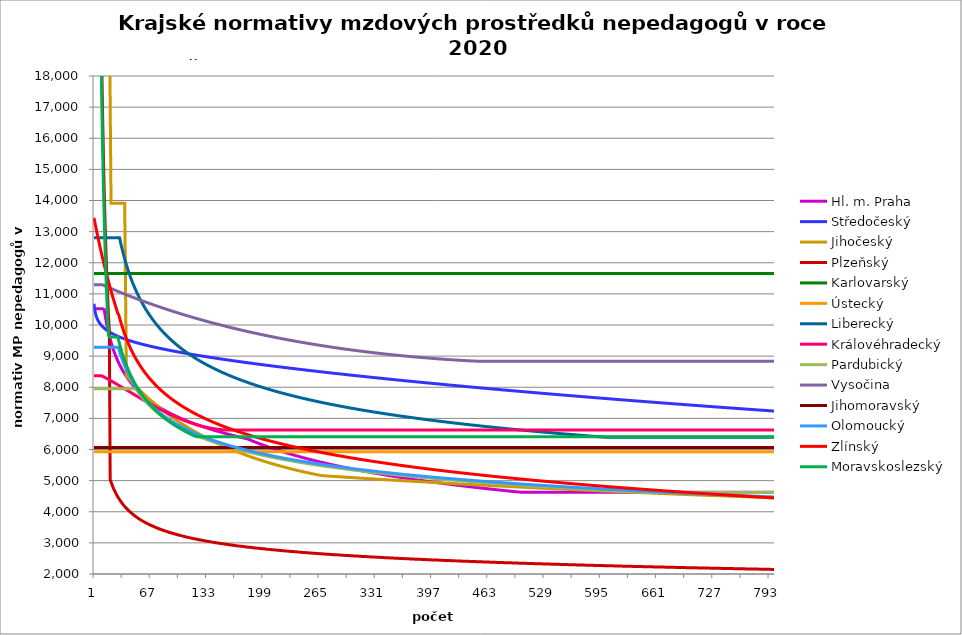
| Category | Hl. m. Praha | Středočeský | Jihočeský | Plzeňský | Karlovarský  | Ústecký   | Liberecký | Královéhradecký | Pardubický | Vysočina | Jihomoravský | Olomoucký | Zlínský | Moravskoslezský |
|---|---|---|---|---|---|---|---|---|---|---|---|---|---|---|
| 0 | 10522.629 | 10682.171 | 47853.511 | 185797.297 | 11657.998 | 5928.91 | 12801.653 | 8369.806 | 7955.115 | 11290.607 | 6064.946 | 9286.859 | 13441.965 | 174150 |
| 1 | 10522.629 | 10466.165 | 47853.511 | 92898.649 | 11657.998 | 5928.91 | 12801.653 | 8369.806 | 7955.115 | 11290.607 | 6064.946 | 9286.859 | 13301.283 | 87075 |
| 2 | 10522.629 | 10342.35 | 47853.511 | 61932.432 | 11657.998 | 5928.91 | 12801.653 | 8369.806 | 7955.115 | 11290.607 | 6064.946 | 9286.859 | 13163.515 | 58050 |
| 3 | 10522.629 | 10255.256 | 47853.511 | 46449.324 | 11657.998 | 5928.91 | 12801.653 | 8369.806 | 7955.115 | 11290.607 | 6064.946 | 9286.859 | 13028.571 | 43537.5 |
| 4 | 10522.629 | 10187.938 | 47853.511 | 37159.459 | 11657.998 | 5928.91 | 12801.653 | 8369.806 | 7955.115 | 11290.607 | 6064.946 | 9286.859 | 12896.367 | 34830 |
| 5 | 10522.629 | 10132.968 | 47853.511 | 30966.216 | 11657.998 | 5928.91 | 12801.653 | 8369.806 | 7955.115 | 11290.607 | 6064.946 | 9286.859 | 12766.818 | 29025 |
| 6 | 10522.629 | 10086.435 | 47853.511 | 26542.471 | 11657.998 | 5928.91 | 12801.653 | 8369.806 | 7955.115 | 11290.607 | 6064.946 | 9286.859 | 12639.846 | 24878.571 |
| 7 | 10522.629 | 10046.025 | 47853.511 | 23224.662 | 11657.998 | 5928.91 | 12801.653 | 8369.806 | 7955.115 | 11290.607 | 6064.946 | 9286.859 | 12515.375 | 21768.75 |
| 8 | 10522.629 | 10010.259 | 47853.511 | 20644.144 | 11657.998 | 5928.91 | 12801.653 | 8369.806 | 7955.115 | 11290.607 | 6064.946 | 9286.859 | 12393.331 | 19350 |
| 9 | 10522.629 | 9978.135 | 47853.511 | 18579.73 | 11657.998 | 5928.91 | 12801.653 | 8369.806 | 7955.115 | 11290.607 | 6064.946 | 9286.859 | 12273.645 | 17415 |
| 10 | 10522.629 | 9948.942 | 20305.409 | 16890.663 | 11657.998 | 5928.91 | 12801.653 | 8356.329 | 7955.115 | 11290.607 | 6064.946 | 9286.859 | 12156.248 | 15831.818 |
| 11 | 10522.629 | 9922.156 | 20305.409 | 15483.108 | 11657.998 | 5928.91 | 12801.653 | 8342.894 | 7955.115 | 11278.536 | 6064.946 | 9286.859 | 12041.076 | 14512.5 |
| 12 | 10494.666 | 9897.384 | 20305.409 | 14292.1 | 11657.998 | 5928.91 | 12801.653 | 8326.829 | 7955.115 | 11266.836 | 6064.946 | 9286.859 | 11928.065 | 13396.154 |
| 13 | 10318.389 | 9874.321 | 20305.409 | 13271.236 | 11657.998 | 5928.91 | 12801.653 | 8313.489 | 7955.115 | 11254.816 | 6064.946 | 9286.859 | 11817.157 | 12439.286 |
| 14 | 10159.276 | 9852.725 | 20305.409 | 12386.486 | 11657.998 | 5928.91 | 12801.653 | 8297.538 | 7955.115 | 11242.822 | 6064.946 | 9286.859 | 11708.291 | 11610 |
| 15 | 10014.594 | 9832.404 | 20305.409 | 11612.331 | 11657.998 | 5928.91 | 12801.653 | 8281.647 | 7955.115 | 11230.853 | 6064.946 | 9286.859 | 11601.413 | 10884.375 |
| 16 | 9882.188 | 9813.198 | 20305.409 | 10929.253 | 11657.998 | 5928.91 | 12801.653 | 8268.451 | 7955.115 | 11219.251 | 6064.946 | 9286.859 | 11496.469 | 10244.118 |
| 17 | 9760.334 | 9794.978 | 20305.409 | 10322.072 | 11657.998 | 5928.91 | 12801.653 | 8252.672 | 7955.115 | 11207.333 | 6064.946 | 9286.859 | 11393.407 | 9675 |
| 18 | 9647.632 | 9777.636 | 20305.409 | 9778.805 | 11657.998 | 5928.91 | 12801.653 | 8236.952 | 7955.115 | 11195.779 | 6064.946 | 9286.859 | 11292.175 | 9612.519 |
| 19 | 9542.932 | 9761.079 | 20305.409 | 5036.264 | 11657.998 | 5928.91 | 12801.653 | 8221.293 | 7955.115 | 11183.911 | 6064.946 | 9286.859 | 11192.727 | 9612.519 |
| 20 | 9445.28 | 9745.229 | 13912.965 | 4955.487 | 11657.998 | 5928.91 | 12801.653 | 8205.693 | 7955.115 | 11172.405 | 6064.946 | 9286.859 | 11095.015 | 9612.519 |
| 21 | 9353.876 | 9730.02 | 13912.965 | 4880.724 | 11657.998 | 5928.91 | 12801.653 | 8190.152 | 7955.115 | 11160.586 | 6064.946 | 9286.859 | 10998.995 | 9612.519 |
| 22 | 9268.043 | 9715.392 | 13912.965 | 4810.707 | 11657.998 | 5928.91 | 12801.653 | 8174.669 | 7955.115 | 11149.129 | 6064.946 | 9286.859 | 10904.622 | 9612.519 |
| 23 | 9187.205 | 9701.297 | 13912.965 | 4745.944 | 11657.998 | 5928.91 | 12801.653 | 8159.245 | 7955.115 | 11137.695 | 6064.946 | 9286.859 | 10811.855 | 9612.519 |
| 24 | 9110.865 | 9687.689 | 13912.965 | 4685.296 | 11657.998 | 5928.91 | 12801.653 | 8143.879 | 7955.115 | 11126.284 | 6064.946 | 9286.859 | 10720.653 | 9612.519 |
| 25 | 9038.596 | 9674.529 | 13912.965 | 4628.514 | 11657.998 | 5928.91 | 12801.653 | 8128.571 | 7955.115 | 11114.897 | 6064.946 | 9286.859 | 10630.977 | 9612.519 |
| 26 | 8970.025 | 9661.784 | 13912.965 | 4574.613 | 11657.998 | 5928.91 | 12801.653 | 8110.785 | 7955.115 | 11103.533 | 6064.946 | 9286.859 | 10542.788 | 9612.519 |
| 27 | 8904.827 | 9649.423 | 13912.965 | 4524.93 | 11657.998 | 5928.91 | 12801.653 | 8095.601 | 7955.115 | 11092.193 | 6064.946 | 9286.859 | 10456.051 | 9612.519 |
| 28 | 8842.715 | 9637.418 | 13912.965 | 4477.043 | 11657.998 | 5928.91 | 12801.653 | 8077.958 | 7955.115 | 11080.875 | 6064.946 | 9286.859 | 10370.729 | 9612.519 |
| 29 | 8783.438 | 9625.745 | 13912.965 | 4431.587 | 11657.998 | 5928.91 | 12801.653 | 8062.896 | 7955.115 | 11069.912 | 6064.946 | 9238.436 | 10330.271 | 9500.918 |
| 30 | 8726.77 | 9614.382 | 13912.965 | 4389.146 | 11657.998 | 5928.91 | 12801.729 | 8047.891 | 7955.115 | 11058.64 | 6064.946 | 9149.834 | 10228.135 | 9394.342 |
| 31 | 8672.513 | 9603.309 | 13912.965 | 4348.885 | 11657.998 | 5928.91 | 12674.904 | 8030.455 | 7955.115 | 11047.391 | 6064.946 | 9062.916 | 10130.995 | 9293.403 |
| 32 | 8620.487 | 9592.507 | 13912.965 | 4310.031 | 11657.998 | 5928.91 | 12554.304 | 8013.095 | 7955.115 | 11036.165 | 6064.946 | 8984.136 | 10038.443 | 9197.619 |
| 33 | 8570.533 | 9581.961 | 13912.965 | 4273.193 | 11657.998 | 5928.91 | 12439.426 | 7998.274 | 7955.115 | 11025.29 | 6064.946 | 8906.715 | 9950.118 | 9106.563 |
| 34 | 8522.506 | 9571.655 | 13912.965 | 4237.633 | 11657.998 | 5928.91 | 12329.823 | 7981.052 | 7955.115 | 11014.109 | 6064.946 | 8833.761 | 9865.695 | 9019.856 |
| 35 | 8476.276 | 9561.576 | 13912.965 | 4203.944 | 11657.998 | 5928.91 | 12225.096 | 7963.904 | 7955.115 | 11003.278 | 6064.946 | 8761.992 | 9784.885 | 8937.159 |
| 36 | 8431.724 | 9551.711 | 13912.965 | 4172.053 | 11657.998 | 5928.91 | 12124.887 | 7949.265 | 7955.115 | 10992.141 | 6064.946 | 8694.427 | 9707.428 | 8858.169 |
| 37 | 8388.745 | 9542.049 | 13912.965 | 4140.641 | 11657.998 | 5928.91 | 12028.872 | 7932.253 | 7955.115 | 10981.68 | 6064.946 | 8630.898 | 9633.089 | 8782.616 |
| 38 | 8347.239 | 9532.579 | 8366.059 | 4110.928 | 11657.998 | 5928.91 | 11936.761 | 7915.314 | 7955.115 | 10970.586 | 6064.946 | 8568.29 | 9561.656 | 8710.254 |
| 39 | 8307.117 | 9523.291 | 8334.74 | 4082.245 | 11657.998 | 5928.91 | 11848.29 | 7898.447 | 7955.115 | 10959.841 | 6064.946 | 8509.503 | 9492.936 | 8640.863 |
| 40 | 8268.299 | 9514.176 | 8303.73 | 4055.154 | 11657.998 | 5928.91 | 11763.22 | 7881.652 | 7955.115 | 10949.116 | 6064.946 | 8451.516 | 9426.756 | 8574.242 |
| 41 | 8230.709 | 9505.226 | 8273.025 | 4028.421 | 11657.998 | 5928.91 | 11681.333 | 7864.929 | 7955.115 | 10938.737 | 6064.946 | 8397.156 | 9362.954 | 8510.21 |
| 42 | 8194.277 | 9496.432 | 8242.621 | 4003.203 | 11657.998 | 5928.91 | 11602.43 | 7850.651 | 7955.115 | 10928.054 | 6064.946 | 8343.491 | 9301.386 | 8448.6 |
| 43 | 8158.941 | 9487.789 | 8212.513 | 3978.299 | 11657.998 | 5928.91 | 11526.33 | 7834.058 | 7955.115 | 10917.391 | 6064.946 | 8293.28 | 9241.918 | 8389.263 |
| 44 | 8124.642 | 9479.288 | 8182.698 | 3954.271 | 11657.998 | 5928.91 | 11452.867 | 7817.535 | 7955.115 | 10906.749 | 6064.946 | 8243.669 | 9184.428 | 8332.059 |
| 45 | 8091.325 | 9470.924 | 8153.171 | 3931.656 | 11657.998 | 5928.91 | 11381.886 | 7801.082 | 7955.115 | 10896.128 | 6064.946 | 8194.648 | 9128.804 | 8276.862 |
| 46 | 8058.941 | 9462.69 | 8123.93 | 3909.298 | 11657.998 | 5928.91 | 11313.248 | 7784.698 | 7955.115 | 10885.849 | 6064.946 | 8148.883 | 9074.94 | 8223.555 |
| 47 | 8027.442 | 9454.582 | 8094.969 | 3887.742 | 11657.998 | 5928.91 | 11246.822 | 7766.058 | 7955.115 | 10875.269 | 6064.946 | 8103.626 | 9022.742 | 8172.032 |
| 48 | 7996.786 | 9446.594 | 8066.285 | 3866.423 | 11657.998 | 5928.91 | 11182.49 | 7749.821 | 7955.115 | 10864.709 | 6064.946 | 8058.869 | 8972.122 | 8122.193 |
| 49 | 7966.931 | 9438.721 | 8037.874 | 3846.412 | 11657.998 | 5928.91 | 11120.139 | 7733.651 | 7955.115 | 10854.17 | 6064.946 | 8017.195 | 8922.996 | 8073.947 |
| 50 | 7937.841 | 9430.959 | 8009.734 | 3826.607 | 11657.998 | 5928.91 | 11059.667 | 7717.549 | 7914.43 | 10844.288 | 6064.946 | 7975.949 | 8875.289 | 8027.21 |
| 51 | 7909.479 | 9423.302 | 7981.86 | 3807.533 | 11657.998 | 5928.91 | 11000.978 | 7701.514 | 7874.855 | 10833.788 | 6064.946 | 7935.125 | 8828.93 | 7981.903 |
| 52 | 7881.814 | 9415.749 | 7954.248 | 3788.647 | 11657.998 | 5928.91 | 10943.984 | 7685.545 | 7836.4 | 10823.309 | 6064.946 | 7897.23 | 8783.853 | 7937.953 |
| 53 | 7854.814 | 9408.293 | 7926.896 | 3770.982 | 11657.998 | 5928.91 | 10888.602 | 7669.642 | 7799.01 | 10813.483 | 6064.946 | 7859.696 | 8739.998 | 7895.292 |
| 54 | 7828.45 | 9400.933 | 7899.799 | 3752.968 | 11657.998 | 5928.91 | 10834.754 | 7653.805 | 7762.635 | 10803.359 | 6064.946 | 7822.517 | 8697.305 | 7853.858 |
| 55 | 7802.696 | 9393.664 | 7872.955 | 3736.141 | 11657.998 | 5928.91 | 10782.37 | 7635.786 | 7727.229 | 10792.938 | 6064.946 | 7788.132 | 8655.722 | 7813.592 |
| 56 | 7777.525 | 9386.483 | 7846.361 | 3719.464 | 11657.998 | 5928.91 | 10731.38 | 7620.088 | 7692.747 | 10782.852 | 6064.946 | 7751.625 | 8615.199 | 7774.438 |
| 57 | 7752.914 | 9379.387 | 7820.012 | 3702.936 | 11657.998 | 5928.91 | 10681.723 | 7604.455 | 7659.149 | 10773.1 | 6064.946 | 7717.859 | 8575.688 | 7736.345 |
| 58 | 7728.841 | 9372.374 | 7793.907 | 3687.047 | 11657.998 | 5928.91 | 10633.34 | 7588.886 | 7626.395 | 10762.738 | 6064.946 | 7686.768 | 8537.146 | 7699.266 |
| 59 | 7705.283 | 9365.44 | 7768.042 | 3671.785 | 11657.998 | 5928.91 | 10586.173 | 7573.38 | 7594.449 | 10752.708 | 6064.946 | 7653.564 | 8499.531 | 7663.155 |
| 60 | 7682.221 | 9358.583 | 7742.413 | 3656.649 | 11657.998 | 5928.91 | 10540.173 | 7555.737 | 7563.277 | 10743.01 | 6064.946 | 7622.987 | 8462.803 | 7627.97 |
| 61 | 7659.635 | 9351.8 | 7717.018 | 3642.119 | 11657.998 | 5928.91 | 10495.289 | 7540.366 | 7532.848 | 10733.017 | 6064.946 | 7592.654 | 8426.928 | 7593.67 |
| 62 | 7637.509 | 9345.09 | 7691.854 | 3627.704 | 11657.998 | 5928.91 | 10451.475 | 7525.058 | 7503.13 | 10723.355 | 6064.946 | 7562.561 | 8391.868 | 7560.219 |
| 63 | 7615.824 | 9338.449 | 7666.919 | 3613.878 | 11657.998 | 5928.91 | 10408.688 | 7509.812 | 7474.095 | 10713.399 | 6064.946 | 7532.706 | 8357.593 | 7527.582 |
| 64 | 7594.565 | 9331.876 | 7642.208 | 3600.157 | 11657.998 | 5928.91 | 10366.886 | 7494.627 | 7445.717 | 10703.461 | 6064.946 | 7503.085 | 8324.072 | 7495.725 |
| 65 | 7573.716 | 9325.369 | 7617.72 | 3586.54 | 11657.998 | 5928.91 | 10326.032 | 7477.349 | 7417.969 | 10694.161 | 6064.946 | 7475.949 | 8291.274 | 7464.616 |
| 66 | 7553.263 | 9318.925 | 7593.451 | 3573.489 | 11657.998 | 5928.91 | 10286.088 | 7462.295 | 7390.828 | 10684.259 | 6064.946 | 7449.009 | 8259.173 | 7434.227 |
| 67 | 7533.192 | 9312.544 | 7569.4 | 3560.533 | 11657.998 | 5928.91 | 10247.019 | 7447.302 | 7364.271 | 10674.376 | 6064.946 | 7422.262 | 8227.743 | 7404.529 |
| 68 | 7513.49 | 9306.222 | 7545.563 | 3548.129 | 11657.998 | 5928.91 | 10208.793 | 7432.369 | 7338.276 | 10664.818 | 6064.946 | 7395.707 | 8196.959 | 7375.495 |
| 69 | 7494.144 | 9299.959 | 7521.937 | 3535.811 | 11657.998 | 5928.91 | 10171.378 | 7417.496 | 7312.823 | 10655.278 | 6064.946 | 7369.34 | 8166.797 | 7347.102 |
| 70 | 7475.143 | 9293.752 | 7498.521 | 3523.578 | 11657.998 | 5928.91 | 10134.746 | 7402.682 | 7287.892 | 10645.755 | 6064.946 | 7345.336 | 8137.235 | 7319.324 |
| 71 | 7456.476 | 9287.6 | 7475.311 | 3511.877 | 11657.998 | 5928.91 | 10098.867 | 7385.824 | 7263.465 | 10636.248 | 6064.946 | 7319.327 | 8108.253 | 7292.14 |
| 72 | 7438.131 | 9281.503 | 7452.306 | 3500.255 | 11657.998 | 5928.91 | 10063.716 | 7371.136 | 7239.524 | 10627.065 | 6064.946 | 7295.647 | 8079.829 | 7265.528 |
| 73 | 7420.098 | 9275.457 | 7429.502 | 3488.708 | 11657.998 | 5928.91 | 10029.266 | 7356.507 | 7216.052 | 10617.287 | 6064.946 | 7272.12 | 8051.945 | 7239.467 |
| 74 | 7402.368 | 9269.462 | 7406.897 | 3477.678 | 11657.998 | 5928.91 | 9995.494 | 7341.935 | 7193.035 | 10607.831 | 6064.946 | 7248.743 | 8024.583 | 7213.939 |
| 75 | 7384.93 | 9263.517 | 7384.49 | 3466.717 | 11657.998 | 5928.91 | 9962.378 | 7327.422 | 7170.455 | 10598.697 | 6064.946 | 7225.517 | 7997.725 | 7188.925 |
| 76 | 7367.777 | 9257.62 | 7362.277 | 3456.259 | 11657.998 | 5928.91 | 9929.894 | 7312.965 | 7148.299 | 10588.971 | 6064.946 | 7204.531 | 7971.354 | 7164.407 |
| 77 | 7350.9 | 9251.771 | 7340.256 | 3445.433 | 11657.998 | 5928.91 | 9898.022 | 7298.565 | 7126.554 | 10579.869 | 6064.946 | 7181.587 | 7945.456 | 7140.369 |
| 78 | 7334.289 | 9245.967 | 7318.426 | 3435.103 | 11657.998 | 5928.91 | 9866.743 | 7284.222 | 7105.205 | 10570.48 | 6064.946 | 7160.855 | 7920.015 | 7116.795 |
| 79 | 7317.938 | 9240.208 | 7296.783 | 3425.262 | 11657.998 | 5928.91 | 9836.037 | 7269.936 | 7084.241 | 10561.41 | 6064.946 | 7140.242 | 7895.016 | 7093.67 |
| 80 | 7301.839 | 9234.492 | 7275.326 | 3415.052 | 11657.998 | 5928.91 | 9805.886 | 7255.705 | 7063.65 | 10552.053 | 6064.946 | 7117.704 | 7870.446 | 7070.979 |
| 81 | 7285.985 | 9228.819 | 7254.052 | 3405.325 | 11657.998 | 5928.91 | 9776.273 | 7241.529 | 7043.419 | 10543.015 | 6064.946 | 7097.339 | 7846.291 | 7048.709 |
| 82 | 7270.368 | 9223.188 | 7232.96 | 3395.653 | 11657.998 | 5928.91 | 9747.182 | 7227.409 | 7023.538 | 10533.991 | 6064.946 | 7079.11 | 7822.54 | 7026.845 |
| 83 | 7254.983 | 9217.597 | 7212.048 | 3386.453 | 11657.998 | 5928.91 | 9718.595 | 7213.344 | 7003.997 | 10524.984 | 6064.946 | 7058.964 | 7799.18 | 7005.377 |
| 84 | 7239.822 | 9212.047 | 7191.312 | 3376.888 | 11657.998 | 5928.91 | 9690.499 | 7201.332 | 6984.785 | 10515.692 | 6064.946 | 7038.933 | 7776.199 | 6984.291 |
| 85 | 7224.88 | 9206.535 | 7170.752 | 3367.789 | 11657.998 | 5928.91 | 9662.878 | 7187.368 | 6965.892 | 10507.014 | 6064.946 | 7021.002 | 7753.586 | 6963.576 |
| 86 | 7210.15 | 9201.061 | 7150.365 | 3359.15 | 11657.998 | 5928.91 | 9635.719 | 7173.459 | 6947.31 | 10497.754 | 6064.946 | 7001.185 | 7731.332 | 6943.221 |
| 87 | 7195.628 | 9195.624 | 7130.15 | 3350.146 | 11657.998 | 5928.91 | 9609.009 | 7159.603 | 6929.03 | 10488.808 | 6064.946 | 6983.446 | 7709.425 | 6923.215 |
| 88 | 7181.307 | 9190.223 | 7110.104 | 3341.597 | 11657.998 | 5928.91 | 9582.733 | 7147.769 | 6911.042 | 10480.175 | 6064.946 | 6965.796 | 7687.856 | 6903.548 |
| 89 | 7167.183 | 9184.858 | 7090.225 | 3332.687 | 11657.998 | 5928.91 | 9556.881 | 7134.012 | 6893.34 | 10471.259 | 6064.946 | 6946.29 | 7666.615 | 6884.211 |
| 90 | 7153.25 | 9179.528 | 7070.512 | 3324.628 | 11657.998 | 5928.91 | 9531.44 | 7120.307 | 6875.914 | 10462.358 | 6064.946 | 6928.827 | 7645.694 | 6865.193 |
| 91 | 7139.503 | 9174.231 | 7050.963 | 3316.208 | 11657.998 | 5928.91 | 9506.4 | 7108.603 | 6858.758 | 10453.472 | 6064.946 | 6911.452 | 7625.083 | 6846.487 |
| 92 | 7125.938 | 9168.968 | 7031.577 | 3307.831 | 11657.998 | 5928.91 | 9481.748 | 7094.996 | 6841.863 | 10444.897 | 6064.946 | 6896.08 | 7604.775 | 6828.083 |
| 93 | 7112.55 | 9163.738 | 7012.35 | 3299.892 | 11657.998 | 5928.91 | 9457.474 | 7083.374 | 6825.224 | 10435.746 | 6064.946 | 6878.869 | 7584.762 | 6809.972 |
| 94 | 7099.336 | 9158.54 | 6993.282 | 3291.991 | 11657.998 | 5928.91 | 9433.57 | 7069.864 | 6808.833 | 10427.2 | 6064.946 | 6861.743 | 7565.035 | 6792.148 |
| 95 | 7086.29 | 9153.373 | 6974.37 | 3284.128 | 11657.998 | 5928.91 | 9410.023 | 7058.324 | 6792.684 | 10418.668 | 6064.946 | 6844.702 | 7545.588 | 6774.602 |
| 96 | 7073.408 | 9148.236 | 6955.614 | 3276.692 | 11657.998 | 5928.91 | 9386.826 | 7046.822 | 6776.771 | 10409.856 | 6064.946 | 6829.626 | 7526.412 | 6757.326 |
| 97 | 7060.687 | 9143.13 | 6937.011 | 3268.902 | 11657.998 | 5928.91 | 9363.969 | 7033.451 | 6761.087 | 10401.352 | 6064.946 | 6814.615 | 7507.502 | 6740.315 |
| 98 | 7048.123 | 9138.053 | 6918.559 | 3261.535 | 11657.998 | 5928.91 | 9341.444 | 7022.03 | 6745.627 | 10392.862 | 6064.946 | 6797.808 | 7488.851 | 6723.56 |
| 99 | 7035.713 | 9133.006 | 6900.258 | 3254.201 | 11657.998 | 5928.91 | 9319.242 | 7010.646 | 6730.385 | 10384.094 | 6064.946 | 6782.937 | 7470.451 | 6707.055 |
| 100 | 7023.452 | 9127.986 | 6882.106 | 3246.9 | 11657.998 | 5928.91 | 9297.355 | 6999.299 | 6715.356 | 10375.924 | 6064.946 | 6768.131 | 7452.298 | 6690.795 |
| 101 | 7011.337 | 9122.995 | 6864.1 | 3239.632 | 11657.998 | 5928.91 | 9275.775 | 6987.988 | 6700.535 | 10367.475 | 6064.946 | 6753.39 | 7434.384 | 6674.772 |
| 102 | 6999.366 | 9118.031 | 6846.24 | 3232.397 | 11657.998 | 5928.91 | 9254.495 | 6976.714 | 6685.916 | 10358.75 | 6064.946 | 6738.712 | 7416.705 | 6658.981 |
| 103 | 6987.534 | 9113.093 | 6828.523 | 3225.572 | 11657.998 | 5928.91 | 9233.508 | 6965.477 | 6671.494 | 10350.619 | 6064.946 | 6724.099 | 7399.254 | 6643.415 |
| 104 | 6975.839 | 9108.183 | 6810.949 | 3218.776 | 11657.998 | 5928.91 | 9212.806 | 6954.275 | 6657.266 | 10342.212 | 6064.946 | 6709.548 | 7382.027 | 6628.071 |
| 105 | 6964.277 | 9103.297 | 6793.516 | 3212.008 | 11657.998 | 5928.91 | 9192.382 | 6943.109 | 6643.226 | 10333.818 | 6064.946 | 6695.061 | 7365.018 | 6612.941 |
| 106 | 6952.847 | 9098.438 | 6776.222 | 3205.269 | 11657.998 | 5928.91 | 9172.231 | 6933.832 | 6629.371 | 10325.438 | 6064.946 | 6680.636 | 7348.221 | 6598.022 |
| 107 | 6941.544 | 9093.603 | 6759.066 | 3198.558 | 11657.998 | 5928.91 | 9152.345 | 6922.732 | 6615.695 | 10317.36 | 6064.946 | 6668.065 | 7331.633 | 6583.307 |
| 108 | 6930.367 | 9088.793 | 6742.046 | 3192.245 | 11657.998 | 5928.91 | 9132.719 | 6911.668 | 6602.194 | 10308.719 | 6064.946 | 6653.755 | 7315.248 | 6568.793 |
| 109 | 6919.312 | 9084.007 | 6725.162 | 3185.589 | 11657.998 | 5928.91 | 9113.346 | 6902.474 | 6588.866 | 10300.667 | 6064.946 | 6639.507 | 7299.062 | 6554.475 |
| 110 | 6908.377 | 9079.245 | 6708.411 | 3179.327 | 11657.998 | 5928.91 | 9094.222 | 6891.474 | 6575.705 | 10292.627 | 6064.946 | 6627.091 | 7283.071 | 6540.347 |
| 111 | 6897.56 | 9074.506 | 6691.793 | 3173.09 | 11657.998 | 5928.91 | 9075.339 | 6882.334 | 6562.709 | 10284.6 | 6064.946 | 6614.72 | 7267.269 | 6526.406 |
| 112 | 6886.858 | 9069.79 | 6675.306 | 3166.878 | 11657.998 | 5928.91 | 9056.694 | 6873.219 | 6549.873 | 10276.3 | 6064.946 | 6600.639 | 7251.654 | 6512.647 |
| 113 | 6876.268 | 9065.096 | 6658.948 | 3160.69 | 11657.998 | 5928.91 | 9038.28 | 6862.312 | 6537.194 | 10268.298 | 6064.946 | 6588.367 | 7236.22 | 6499.067 |
| 114 | 6865.789 | 9060.425 | 6642.719 | 3154.526 | 11657.998 | 5928.91 | 9020.093 | 6853.249 | 6524.668 | 10260.309 | 6064.946 | 6576.14 | 7220.965 | 6485.661 |
| 115 | 6855.419 | 9055.775 | 6626.617 | 3148.746 | 11657.998 | 5928.91 | 9002.128 | 6844.21 | 6512.293 | 10252.332 | 6064.946 | 6562.222 | 7205.884 | 6472.426 |
| 116 | 6845.155 | 9051.147 | 6610.64 | 3142.629 | 11657.998 | 5928.91 | 8984.38 | 6835.195 | 6500.065 | 10244.084 | 6064.946 | 6550.092 | 7190.973 | 6459.358 |
| 117 | 6834.994 | 9046.54 | 6594.788 | 3136.893 | 11657.998 | 5928.91 | 8966.844 | 6826.204 | 6487.982 | 10236.132 | 6064.946 | 6538.007 | 7176.23 | 6446.452 |
| 118 | 6824.936 | 9041.954 | 6579.06 | 3131.177 | 11657.998 | 5928.91 | 8949.516 | 6817.236 | 6476.039 | 10228.193 | 6064.946 | 6525.967 | 7161.65 | 6433.707 |
| 119 | 6814.978 | 9037.388 | 6563.453 | 3125.483 | 11657.998 | 5928.91 | 8932.392 | 6808.292 | 6464.234 | 10220.549 | 6064.946 | 6513.971 | 7147.231 | 6421.118 |
| 120 | 6805.118 | 9032.843 | 6547.968 | 3119.809 | 11657.998 | 5928.91 | 8915.467 | 6801.153 | 6452.565 | 10212.352 | 6064.946 | 6502.018 | 7132.969 | 6409.938 |
| 121 | 6795.355 | 9028.317 | 6532.602 | 3114.156 | 11657.998 | 5928.91 | 8898.737 | 6792.251 | 6441.028 | 10204.449 | 6064.946 | 6491.808 | 7118.86 | 6409.938 |
| 122 | 6785.686 | 9023.811 | 6517.355 | 3108.524 | 11657.998 | 5928.91 | 8882.199 | 6785.146 | 6429.622 | 10196.841 | 6064.946 | 6479.937 | 7104.902 | 6409.938 |
| 123 | 6776.109 | 9019.323 | 6502.225 | 3103.261 | 11657.998 | 5928.91 | 8865.848 | 6776.286 | 6418.342 | 10188.962 | 6064.946 | 6468.11 | 7091.093 | 6409.938 |
| 124 | 6766.624 | 9014.855 | 6487.211 | 3097.668 | 11657.998 | 5928.91 | 8849.68 | 6769.215 | 6407.188 | 10181.377 | 6064.946 | 6456.325 | 7077.428 | 6409.938 |
| 125 | 6757.228 | 9010.406 | 6472.312 | 3092.443 | 11657.998 | 5928.91 | 8833.693 | 6762.158 | 6396.155 | 10173.803 | 6064.946 | 6446.258 | 7063.905 | 6409.938 |
| 126 | 6747.92 | 9005.975 | 6457.528 | 3087.235 | 11657.998 | 5928.91 | 8817.883 | 6753.358 | 6385.243 | 10165.68 | 6064.946 | 6434.553 | 7050.522 | 6409.938 |
| 127 | 6738.698 | 9001.562 | 6442.856 | 3082.044 | 11657.998 | 5928.91 | 8802.245 | 6746.334 | 6374.448 | 10158.129 | 6064.946 | 6424.553 | 7037.275 | 6409.938 |
| 128 | 6729.56 | 8997.167 | 6428.296 | 3076.871 | 11657.998 | 5928.91 | 8786.777 | 6739.325 | 6363.769 | 10150.59 | 6064.946 | 6412.927 | 7024.163 | 6409.938 |
| 129 | 6720.506 | 8992.789 | 6413.847 | 3071.716 | 11657.998 | 5928.91 | 8771.476 | 6734.077 | 6353.203 | 10143.061 | 6064.946 | 6402.994 | 7011.182 | 6409.938 |
| 130 | 6711.533 | 8988.429 | 6399.508 | 3066.577 | 11657.998 | 5928.91 | 8756.338 | 6727.094 | 6342.748 | 10135.544 | 6064.946 | 6391.446 | 6998.33 | 6409.938 |
| 131 | 6702.641 | 8984.086 | 6385.277 | 3061.797 | 11657.998 | 5928.91 | 8741.36 | 6720.124 | 6332.402 | 10128.038 | 6064.946 | 6381.58 | 6985.606 | 6409.938 |
| 132 | 6693.827 | 8979.76 | 6371.155 | 3056.692 | 11657.998 | 5928.91 | 8726.539 | 6714.907 | 6322.163 | 10120.543 | 6064.946 | 6371.744 | 6973.005 | 6409.938 |
| 133 | 6685.091 | 8975.45 | 6357.138 | 3051.942 | 11657.998 | 5928.91 | 8711.873 | 6707.963 | 6312.029 | 10112.782 | 6064.946 | 6361.939 | 6960.527 | 6409.938 |
| 134 | 6676.431 | 8971.157 | 6343.228 | 3046.87 | 11657.998 | 5928.91 | 8697.358 | 6702.764 | 6301.998 | 10105.309 | 6064.946 | 6350.538 | 6948.169 | 6409.938 |
| 135 | 6667.846 | 8966.88 | 6329.422 | 3042.151 | 11657.998 | 5928.91 | 8682.991 | 6697.574 | 6292.069 | 10097.848 | 6064.946 | 6340.798 | 6935.928 | 6409.938 |
| 136 | 6659.335 | 8962.62 | 6315.719 | 3037.446 | 11657.998 | 5928.91 | 8668.771 | 6690.665 | 6282.238 | 10090.673 | 6064.946 | 6331.087 | 6923.804 | 6409.938 |
| 137 | 6650.896 | 8958.374 | 6302.12 | 3032.756 | 11657.998 | 5928.91 | 8654.694 | 6685.493 | 6272.506 | 10083.233 | 6064.946 | 6321.407 | 6911.793 | 6409.938 |
| 138 | 6642.528 | 8954.145 | 6288.622 | 3028.081 | 11657.998 | 5928.91 | 8640.758 | 6680.33 | 6262.869 | 10075.804 | 6064.946 | 6311.756 | 6899.894 | 6409.938 |
| 139 | 6634.23 | 8949.931 | 6275.226 | 3023.419 | 11657.998 | 5928.91 | 8626.96 | 6676.891 | 6253.327 | 10068.661 | 6064.946 | 6302.134 | 6888.104 | 6409.938 |
| 140 | 6626.001 | 8945.731 | 6261.929 | 3018.773 | 11657.998 | 5928.91 | 8613.298 | 6671.741 | 6243.877 | 10061.253 | 6064.946 | 6292.542 | 6876.423 | 6409.938 |
| 141 | 6617.84 | 8941.547 | 6248.731 | 3014.471 | 11657.998 | 5928.91 | 8599.77 | 6666.598 | 6234.518 | 10054.131 | 6064.946 | 6282.979 | 6864.847 | 6409.938 |
| 142 | 6609.745 | 8937.378 | 6235.631 | 3009.851 | 11657.998 | 5928.91 | 8586.373 | 6663.174 | 6225.248 | 10047.018 | 6064.946 | 6273.445 | 6853.376 | 6409.938 |
| 143 | 6601.716 | 8933.223 | 6222.629 | 3005.574 | 11657.998 | 5928.91 | 8573.104 | 6659.754 | 6216.067 | 10039.642 | 6064.946 | 6263.939 | 6842.007 | 6409.938 |
| 144 | 6593.752 | 8929.083 | 6209.723 | 3000.982 | 11657.998 | 5928.91 | 8559.962 | 6654.629 | 6206.971 | 10032.55 | 6064.946 | 6256.04 | 6830.739 | 6409.938 |
| 145 | 6585.851 | 8924.957 | 6196.913 | 2996.731 | 11657.998 | 5928.91 | 8546.945 | 6651.218 | 6197.961 | 10025.468 | 6064.946 | 6246.588 | 6819.57 | 6409.938 |
| 146 | 6578.013 | 8920.844 | 6184.197 | 2992.491 | 11657.998 | 5928.91 | 8534.05 | 6647.809 | 6189.034 | 10018.395 | 6064.946 | 6237.164 | 6808.499 | 6409.938 |
| 147 | 6570.236 | 8916.746 | 6171.575 | 2987.939 | 11657.998 | 5928.91 | 8521.276 | 6646.107 | 6180.19 | 10011.333 | 6064.946 | 6227.768 | 6797.523 | 6409.938 |
| 148 | 6562.52 | 8912.662 | 6159.047 | 2983.724 | 11657.998 | 5928.91 | 8508.62 | 6642.704 | 6171.426 | 10004.281 | 6064.946 | 6219.96 | 6786.642 | 6409.938 |
| 149 | 6554.864 | 8908.591 | 6146.61 | 2979.521 | 11657.998 | 5928.91 | 8496.081 | 6639.304 | 6162.741 | 9997.238 | 6064.946 | 6210.616 | 6775.853 | 6409.938 |
| 150 | 6547.267 | 8904.533 | 6134.265 | 2975.33 | 11657.998 | 5928.91 | 8483.656 | 6637.606 | 6154.135 | 9990.206 | 6064.946 | 6202.851 | 6765.156 | 6409.938 |
| 151 | 6539.727 | 8900.488 | 6122.01 | 2971.472 | 11657.998 | 5928.91 | 8471.343 | 6634.211 | 6145.606 | 9983.183 | 6064.946 | 6193.558 | 6754.549 | 6409.938 |
| 152 | 6532.245 | 8896.457 | 6109.845 | 2967.303 | 11657.998 | 5928.91 | 8459.142 | 6632.515 | 6137.152 | 9976.171 | 6064.946 | 6184.293 | 6744.03 | 6409.938 |
| 153 | 6524.818 | 8892.438 | 6097.769 | 2963.147 | 11657.998 | 5928.91 | 8447.05 | 6630.82 | 6128.773 | 9969.168 | 6064.946 | 6176.594 | 6733.598 | 6409.938 |
| 154 | 6517.448 | 8888.433 | 6085.782 | 2959.32 | 11657.998 | 5928.91 | 8435.064 | 6629.126 | 6120.468 | 9962.443 | 6064.946 | 6168.913 | 6723.251 | 6409.938 |
| 155 | 6510.131 | 8884.44 | 6073.882 | 2955.185 | 11657.998 | 5928.91 | 8423.185 | 6629.126 | 6112.234 | 9955.46 | 6064.946 | 6159.722 | 6712.99 | 6409.938 |
| 156 | 6502.869 | 8880.459 | 6062.069 | 2951.379 | 11657.998 | 5928.91 | 8411.41 | 6629.126 | 6104.071 | 9948.486 | 6064.946 | 6152.083 | 6702.811 | 6409.938 |
| 157 | 6495.659 | 8876.491 | 6050.341 | 2947.267 | 11657.998 | 5928.91 | 8399.737 | 6629.126 | 6095.979 | 9941.789 | 6064.946 | 6142.942 | 6692.714 | 6409.938 |
| 158 | 6488.502 | 8872.534 | 6038.699 | 2943.481 | 11657.998 | 5928.91 | 8388.164 | 6629.126 | 6087.955 | 9935.102 | 6064.946 | 6135.345 | 6682.697 | 6409.938 |
| 159 | 6481.396 | 8868.59 | 6027.142 | 2939.705 | 11657.998 | 5928.91 | 8376.691 | 6629.126 | 6079.999 | 9928.157 | 6064.946 | 6127.767 | 6672.76 | 6409.938 |
| 160 | 6474.341 | 8864.658 | 6015.668 | 2935.939 | 11657.998 | 5928.91 | 8365.316 | 6629.126 | 6072.11 | 9921.487 | 6064.946 | 6118.698 | 6662.901 | 6409.938 |
| 161 | 6467.336 | 8860.738 | 6004.278 | 2932.182 | 11657.998 | 5928.91 | 8354.036 | 6629.126 | 6064.286 | 9915.094 | 6064.946 | 6111.16 | 6653.119 | 6409.938 |
| 162 | 6460.381 | 8856.829 | 5992.97 | 2928.123 | 11657.998 | 5928.91 | 8342.852 | 6629.126 | 6056.528 | 9908.176 | 6064.946 | 6103.642 | 6643.413 | 6409.938 |
| 163 | 6453.474 | 8852.932 | 5981.744 | 2924.697 | 11657.998 | 5928.91 | 8331.761 | 6629.126 | 6048.833 | 9901.534 | 6064.946 | 6096.142 | 6633.781 | 6409.938 |
| 164 | 6446.615 | 8849.046 | 5970.599 | 2920.969 | 11657.998 | 5928.91 | 8320.761 | 6629.126 | 6041.201 | 9894.9 | 6064.946 | 6088.66 | 6624.224 | 6409.938 |
| 165 | 6439.803 | 8845.171 | 5959.534 | 2917.25 | 11657.998 | 5928.91 | 8309.852 | 6629.126 | 6033.631 | 9888.276 | 6064.946 | 6081.196 | 6614.738 | 6409.938 |
| 166 | 6433.038 | 8841.308 | 5948.549 | 2913.541 | 11657.998 | 5928.91 | 8299.033 | 6629.126 | 6026.122 | 9881.66 | 6064.946 | 6073.751 | 6605.325 | 6409.938 |
| 167 | 6426.319 | 8837.456 | 5937.643 | 2909.841 | 11657.998 | 5928.91 | 8288.301 | 6629.126 | 6018.673 | 9875.053 | 6064.946 | 6066.324 | 6595.982 | 6409.938 |
| 168 | 6419.645 | 8833.614 | 5926.815 | 2906.458 | 11657.998 | 5928.91 | 8277.656 | 6629.126 | 6011.283 | 9868.456 | 6064.946 | 6057.436 | 6586.708 | 6409.938 |
| 169 | 6413.017 | 8829.784 | 5916.066 | 2902.776 | 11657.998 | 5928.91 | 8267.097 | 6629.126 | 6003.952 | 9862.13 | 6064.946 | 6050.049 | 6577.503 | 6409.938 |
| 170 | 6406.432 | 8825.964 | 5905.393 | 2899.41 | 11657.998 | 5928.91 | 8256.621 | 6629.126 | 5996.679 | 9855.812 | 6064.946 | 6044.152 | 6568.365 | 6409.938 |
| 171 | 6399.891 | 8822.155 | 5894.797 | 2895.746 | 11657.998 | 5928.91 | 8246.229 | 6629.126 | 5989.462 | 9849.24 | 6064.946 | 6036.797 | 6559.294 | 6409.938 |
| 172 | 6393.393 | 8818.356 | 5884.277 | 2892.395 | 11657.998 | 5928.91 | 8235.918 | 6629.126 | 5982.302 | 9842.676 | 6064.946 | 6029.46 | 6550.289 | 6409.938 |
| 173 | 6386.938 | 8814.567 | 5873.833 | 2889.052 | 11657.998 | 5928.91 | 8225.688 | 6629.126 | 5975.196 | 9836.383 | 6064.946 | 6022.141 | 6541.348 | 6409.938 |
| 174 | 6380.525 | 8810.789 | 5863.463 | 2885.414 | 11657.998 | 5928.91 | 8215.537 | 6629.126 | 5968.145 | 9830.099 | 6064.946 | 6014.84 | 6532.472 | 6409.938 |
| 175 | 6374.153 | 8807.021 | 5853.167 | 2882.088 | 11657.998 | 5928.91 | 8205.465 | 6629.126 | 5961.148 | 9823.822 | 6064.946 | 6007.556 | 6523.658 | 6409.938 |
| 176 | 6367.822 | 8803.264 | 5842.944 | 2878.769 | 11657.998 | 5928.91 | 8195.47 | 6629.126 | 5954.203 | 9817.292 | 6064.946 | 6000.29 | 6514.907 | 6409.938 |
| 177 | 6361.531 | 8799.516 | 5832.795 | 2875.457 | 11657.998 | 5928.91 | 8185.552 | 6629.126 | 5947.311 | 9811.032 | 6064.946 | 5993.042 | 6506.217 | 6409.938 |
| 178 | 6355.28 | 8795.778 | 5822.718 | 2872.154 | 11657.998 | 5928.91 | 8175.708 | 6629.126 | 5940.471 | 9804.78 | 6064.946 | 5987.256 | 6497.588 | 6409.938 |
| 179 | 6349.068 | 8792.049 | 5812.713 | 2868.858 | 11657.998 | 5928.91 | 8165.939 | 6629.126 | 5933.681 | 9798.535 | 6064.946 | 5980.039 | 6489.018 | 6409.938 |
| 180 | 6342.353 | 8788.331 | 5802.779 | 2865.569 | 11657.998 | 5928.91 | 8156.242 | 6629.126 | 5926.941 | 9792.299 | 6064.946 | 5972.839 | 6480.507 | 6409.938 |
| 181 | 6330.674 | 8784.622 | 5792.916 | 2862.288 | 11657.998 | 5928.91 | 8146.618 | 6629.126 | 5920.251 | 9786.07 | 6064.946 | 5967.092 | 6472.054 | 6409.938 |
| 182 | 6319.095 | 8780.923 | 5783.123 | 2859.312 | 11657.998 | 5928.91 | 8137.065 | 6629.126 | 5913.61 | 9779.85 | 6064.946 | 5959.923 | 6463.659 | 6409.938 |
| 183 | 6307.613 | 8777.232 | 5773.399 | 2856.045 | 11657.998 | 5928.91 | 8127.583 | 6629.126 | 5907.016 | 9773.896 | 6064.946 | 5952.772 | 6455.32 | 6409.938 |
| 184 | 6296.228 | 8773.552 | 5763.745 | 2852.786 | 11657.998 | 5928.91 | 8118.169 | 6629.126 | 5900.471 | 9767.69 | 6064.946 | 5947.063 | 6447.038 | 6409.938 |
| 185 | 6284.937 | 8769.88 | 5754.159 | 2849.829 | 11657.998 | 5928.91 | 8108.824 | 6629.126 | 5893.972 | 9761.493 | 6064.946 | 5939.943 | 6438.81 | 6409.938 |
| 186 | 6273.74 | 8766.218 | 5744.641 | 2846.584 | 11657.998 | 5928.91 | 8099.547 | 6629.126 | 5887.519 | 9755.561 | 6064.946 | 5932.839 | 6430.637 | 6409.938 |
| 187 | 6262.635 | 8762.565 | 5735.191 | 2843.346 | 11657.998 | 5928.91 | 8090.336 | 6629.126 | 5881.113 | 9749.637 | 6064.946 | 5927.168 | 6422.518 | 6409.938 |
| 188 | 6251.621 | 8758.921 | 5725.808 | 2840.409 | 11657.998 | 5928.91 | 8081.191 | 6629.126 | 5874.751 | 9743.463 | 6064.946 | 5920.095 | 6414.452 | 6409.938 |
| 189 | 6240.696 | 8755.285 | 5716.491 | 2837.478 | 11657.998 | 5928.91 | 8072.111 | 6629.126 | 5868.434 | 9737.296 | 6064.946 | 5914.449 | 6406.438 | 6409.938 |
| 190 | 6229.86 | 8751.659 | 5707.24 | 2834.261 | 11657.998 | 5928.91 | 8063.095 | 6629.126 | 5862.161 | 9731.65 | 6064.946 | 5907.407 | 6398.476 | 6409.938 |
| 191 | 6219.11 | 8748.041 | 5698.055 | 2831.343 | 11657.998 | 5928.91 | 8054.142 | 6629.126 | 5855.931 | 9725.498 | 6064.946 | 5901.784 | 6390.566 | 6409.938 |
| 192 | 6208.446 | 8744.432 | 5688.935 | 2828.43 | 11657.998 | 5928.91 | 8045.252 | 6629.126 | 5849.744 | 9719.866 | 6064.946 | 5894.772 | 6382.706 | 6409.938 |
| 193 | 6197.867 | 8740.832 | 5679.879 | 2825.234 | 11657.998 | 5928.91 | 8036.423 | 6629.126 | 5843.6 | 9713.73 | 6064.946 | 5889.174 | 6374.895 | 6409.938 |
| 194 | 6187.371 | 8737.24 | 5670.887 | 2822.334 | 11657.998 | 5928.91 | 8027.656 | 6629.126 | 5837.497 | 9707.856 | 6064.946 | 5883.586 | 6367.135 | 6409.938 |
| 195 | 6176.957 | 8733.656 | 5661.959 | 2819.44 | 11657.998 | 5928.91 | 8018.948 | 6629.126 | 5831.436 | 9701.734 | 6064.946 | 5876.617 | 6359.422 | 6409.938 |
| 196 | 6166.624 | 8730.081 | 5653.094 | 2816.552 | 11657.998 | 5928.91 | 8010.3 | 6629.126 | 5825.416 | 9696.129 | 6064.946 | 5871.053 | 6351.758 | 6409.938 |
| 197 | 6156.372 | 8726.514 | 5644.292 | 2813.67 | 11657.998 | 5928.91 | 8001.711 | 6629.126 | 5819.435 | 9690.277 | 6064.946 | 5864.113 | 6344.142 | 6409.938 |
| 198 | 6146.198 | 8722.956 | 5635.552 | 2810.794 | 11657.998 | 5928.91 | 7993.179 | 6629.126 | 5813.495 | 9684.685 | 6064.946 | 5858.573 | 6336.572 | 6409.938 |
| 199 | 6136.102 | 8719.405 | 5626.873 | 2807.924 | 11657.998 | 5928.91 | 7984.705 | 6629.126 | 5807.594 | 9678.847 | 6064.946 | 5853.044 | 6329.049 | 6409.938 |
| 200 | 6126.084 | 8715.863 | 5618.256 | 2805.06 | 11657.998 | 5928.91 | 7976.287 | 6629.126 | 5801.732 | 9673.015 | 6064.946 | 5847.525 | 6321.572 | 6409.938 |
| 201 | 6116.14 | 8712.329 | 5609.7 | 2802.201 | 11657.998 | 5928.91 | 7967.925 | 6629.126 | 5795.908 | 9667.443 | 6064.946 | 5840.64 | 6314.14 | 6409.938 |
| 202 | 6106.272 | 8708.802 | 5601.204 | 2799.348 | 11657.998 | 5928.91 | 7959.619 | 6629.126 | 5790.122 | 9661.625 | 6064.946 | 5835.145 | 6306.753 | 6409.938 |
| 203 | 6096.478 | 8705.284 | 5592.769 | 2796.786 | 11657.998 | 5928.91 | 7951.366 | 6629.126 | 5784.373 | 9656.067 | 6064.946 | 5829.659 | 6299.41 | 6409.938 |
| 204 | 6086.756 | 8701.773 | 5584.392 | 2793.944 | 11657.998 | 5928.91 | 7943.168 | 6629.126 | 5778.662 | 9650.263 | 6064.946 | 5824.184 | 6292.11 | 6409.938 |
| 205 | 6077.106 | 8698.27 | 5576.075 | 2791.108 | 11657.998 | 5928.91 | 7935.023 | 6629.126 | 5772.987 | 9644.465 | 6064.946 | 5817.355 | 6284.855 | 6409.938 |
| 206 | 6067.527 | 8694.775 | 5567.817 | 2788.561 | 11657.998 | 5928.91 | 7926.931 | 6629.126 | 5767.348 | 9639.178 | 6064.946 | 5811.903 | 6277.641 | 6409.938 |
| 207 | 6058.019 | 8691.288 | 5559.617 | 2785.736 | 11657.998 | 5928.91 | 7918.89 | 6629.126 | 5761.745 | 9633.394 | 6064.946 | 5806.461 | 6270.471 | 6409.938 |
| 208 | 6048.579 | 8687.808 | 5551.475 | 2783.198 | 11657.998 | 5928.91 | 7910.902 | 6629.126 | 5756.178 | 9628.119 | 6064.946 | 5801.029 | 6263.342 | 6409.938 |
| 209 | 6039.208 | 8684.335 | 5543.39 | 2780.384 | 11657.998 | 5928.91 | 7902.963 | 6629.126 | 5750.645 | 9622.348 | 6064.946 | 5795.607 | 6256.254 | 6409.938 |
| 210 | 6029.904 | 8680.87 | 5535.363 | 2777.856 | 11657.998 | 5928.91 | 7895.075 | 6629.126 | 5745.147 | 9617.086 | 6064.946 | 5790.196 | 6249.207 | 6409.938 |
| 211 | 6020.667 | 8677.413 | 5527.392 | 2775.053 | 11657.998 | 5928.91 | 7887.237 | 6629.126 | 5739.683 | 9611.328 | 6064.946 | 5784.795 | 6242.2 | 6409.938 |
| 212 | 6011.495 | 8673.962 | 5519.478 | 2772.535 | 11657.998 | 5928.91 | 7879.448 | 6629.126 | 5734.253 | 9606.077 | 6064.946 | 5779.404 | 6235.234 | 6409.938 |
| 213 | 6002.388 | 8670.519 | 5511.619 | 2769.742 | 11657.998 | 5928.91 | 7871.707 | 6629.126 | 5728.856 | 9600.582 | 6064.946 | 5774.022 | 6228.307 | 6409.938 |
| 214 | 5993.346 | 8667.084 | 5503.817 | 2767.234 | 11657.998 | 5928.91 | 7864.014 | 6629.126 | 5723.492 | 9595.094 | 6064.946 | 5768.651 | 6221.419 | 6409.938 |
| 215 | 5984.366 | 8663.655 | 5496.069 | 2764.73 | 11657.998 | 5928.91 | 7856.369 | 6629.126 | 5718.161 | 9589.612 | 6064.946 | 5763.29 | 6214.57 | 6409.938 |
| 216 | 5975.45 | 8660.234 | 5488.376 | 2762.23 | 11657.998 | 5928.91 | 7848.771 | 6629.126 | 5712.862 | 9584.385 | 6064.946 | 5757.939 | 6207.759 | 6409.938 |
| 217 | 5966.595 | 8656.819 | 5480.738 | 2759.458 | 11657.998 | 5928.91 | 7841.219 | 6629.126 | 5707.595 | 9578.915 | 6064.946 | 5752.597 | 6200.985 | 6409.938 |
| 218 | 5957.801 | 8653.412 | 5473.153 | 2756.968 | 11657.998 | 5928.91 | 7833.712 | 6629.126 | 5702.36 | 9573.699 | 6064.946 | 5747.266 | 6194.25 | 6409.938 |
| 219 | 5949.067 | 8650.011 | 5465.623 | 2754.483 | 11657.998 | 5928.91 | 7826.251 | 6629.126 | 5697.156 | 9568.241 | 6064.946 | 5741.944 | 6187.551 | 6409.938 |
| 220 | 5940.393 | 8646.618 | 5458.146 | 2752.002 | 11657.998 | 5928.91 | 7818.835 | 6629.126 | 5691.982 | 9563.037 | 6064.946 | 5736.633 | 6180.889 | 6409.938 |
| 221 | 5931.777 | 8643.231 | 5450.721 | 2749.525 | 11657.998 | 5928.91 | 7811.464 | 6629.126 | 5686.839 | 9557.592 | 6064.946 | 5731.331 | 6174.263 | 6409.938 |
| 222 | 5923.22 | 8639.851 | 5443.35 | 2747.053 | 11657.998 | 5928.91 | 7804.136 | 6629.126 | 5681.727 | 9552.647 | 6064.946 | 5726.039 | 6167.673 | 6409.938 |
| 223 | 5914.72 | 8636.478 | 5436.031 | 2744.585 | 11657.998 | 5928.91 | 7796.852 | 6629.126 | 5676.644 | 9547.46 | 6064.946 | 5720.756 | 6161.118 | 6409.938 |
| 224 | 5906.277 | 8633.112 | 5428.763 | 2742.122 | 11657.998 | 5928.91 | 7789.61 | 6629.126 | 5671.591 | 9542.032 | 6064.946 | 5715.484 | 6154.598 | 6409.938 |
| 225 | 5897.89 | 8629.752 | 5421.548 | 2739.663 | 11657.998 | 5928.91 | 7782.411 | 6629.126 | 5666.567 | 9537.103 | 6064.946 | 5710.221 | 6148.113 | 6409.938 |
| 226 | 5889.559 | 8626.399 | 5414.383 | 2737.209 | 11657.998 | 5928.91 | 7775.254 | 6629.126 | 5661.572 | 9531.686 | 6064.946 | 5706.28 | 6141.663 | 6409.938 |
| 227 | 5881.282 | 8623.052 | 5407.27 | 2735.031 | 11657.998 | 5928.91 | 7768.139 | 6629.126 | 5656.606 | 9526.768 | 6064.946 | 5701.034 | 6135.246 | 6409.938 |
| 228 | 5873.059 | 8619.712 | 5400.207 | 2732.585 | 11657.998 | 5928.91 | 7761.065 | 6629.126 | 5651.668 | 9521.609 | 6064.946 | 5695.798 | 6128.864 | 6409.938 |
| 229 | 5864.89 | 8616.379 | 5393.195 | 2730.143 | 11657.998 | 5928.91 | 7754.031 | 6629.126 | 5646.758 | 9516.456 | 6064.946 | 5690.571 | 6122.514 | 6409.938 |
| 230 | 5856.774 | 8613.052 | 5386.233 | 2727.706 | 11657.998 | 5928.91 | 7747.038 | 6629.126 | 5641.876 | 9511.553 | 6064.946 | 5685.354 | 6116.198 | 6409.938 |
| 231 | 5848.71 | 8609.731 | 5379.32 | 2725.543 | 11657.998 | 5928.91 | 7740.084 | 6629.126 | 5637.021 | 9506.166 | 6064.946 | 5681.448 | 6109.914 | 6409.938 |
| 232 | 5840.698 | 8606.416 | 5372.457 | 2723.113 | 11657.998 | 5928.91 | 7733.17 | 6629.126 | 5632.193 | 9501.274 | 6064.946 | 5676.247 | 6103.662 | 6409.938 |
| 233 | 5832.737 | 8603.108 | 5365.643 | 2720.689 | 11657.998 | 5928.91 | 7726.296 | 6629.126 | 5627.393 | 9496.387 | 6064.946 | 5671.056 | 6097.442 | 6409.938 |
| 234 | 5824.827 | 8599.806 | 5358.877 | 2718.537 | 11657.998 | 5928.91 | 7719.459 | 6629.126 | 5622.619 | 9491.261 | 6064.946 | 5665.875 | 6091.255 | 6409.938 |
| 235 | 5816.966 | 8596.51 | 5352.16 | 2716.12 | 11657.998 | 5928.91 | 7712.661 | 6629.126 | 5617.871 | 9486.384 | 6064.946 | 5661.995 | 6085.098 | 6409.938 |
| 236 | 5809.155 | 8593.221 | 5345.492 | 2713.976 | 11657.998 | 5928.91 | 7705.901 | 6629.126 | 5613.149 | 9481.512 | 6064.946 | 5656.83 | 6078.972 | 6409.938 |
| 237 | 5801.393 | 8589.937 | 5338.871 | 2711.567 | 11657.998 | 5928.91 | 7699.178 | 6629.126 | 5608.453 | 9476.402 | 6064.946 | 5651.675 | 6072.878 | 6409.938 |
| 238 | 5793.679 | 8586.66 | 5332.297 | 2709.43 | 11657.998 | 5928.91 | 7692.492 | 6629.126 | 5603.783 | 9471.54 | 6064.946 | 5647.814 | 6066.813 | 6409.938 |
| 239 | 5786.013 | 8583.388 | 5325.771 | 2707.029 | 11657.998 | 5928.91 | 7685.843 | 6629.126 | 5599.138 | 9466.926 | 6064.946 | 5642.675 | 6060.779 | 6409.938 |
| 240 | 5778.394 | 8580.123 | 5319.292 | 2704.899 | 11657.998 | 5928.91 | 7679.23 | 6629.126 | 5594.518 | 9461.832 | 6064.946 | 5637.545 | 6054.775 | 6409.938 |
| 241 | 5770.822 | 8576.864 | 5312.859 | 2702.772 | 11657.998 | 5928.91 | 7672.654 | 6629.126 | 5589.923 | 9456.986 | 6064.946 | 5633.704 | 6048.8 | 6409.938 |
| 242 | 5763.296 | 8573.61 | 5306.473 | 2700.383 | 11657.998 | 5928.91 | 7666.112 | 6629.126 | 5585.353 | 9452.386 | 6064.946 | 5628.591 | 6042.854 | 6409.938 |
| 243 | 5755.816 | 8570.362 | 5300.134 | 2698.263 | 11657.998 | 5928.91 | 7659.607 | 6629.126 | 5580.807 | 9447.549 | 6064.946 | 5624.762 | 6036.938 | 6409.938 |
| 244 | 5748.381 | 8567.121 | 5293.84 | 2696.147 | 11657.998 | 5928.91 | 7653.136 | 6629.126 | 5576.284 | 9442.717 | 6064.946 | 5619.665 | 6031.05 | 6409.938 |
| 245 | 5740.991 | 8563.885 | 5287.591 | 2694.034 | 11657.998 | 5928.91 | 7646.699 | 6629.126 | 5571.786 | 9437.89 | 6064.946 | 5615.848 | 6025.19 | 6409.938 |
| 246 | 5733.645 | 8560.654 | 5281.388 | 2691.66 | 11657.998 | 5928.91 | 7640.297 | 6629.126 | 5567.311 | 9433.309 | 6064.946 | 5610.767 | 6019.359 | 6409.938 |
| 247 | 5726.343 | 8557.43 | 5275.23 | 2689.554 | 11657.998 | 5928.91 | 7633.929 | 6629.126 | 5562.86 | 9428.25 | 6064.946 | 5605.695 | 6013.556 | 6409.938 |
| 248 | 5719.085 | 8554.211 | 5269.117 | 2687.451 | 11657.998 | 5928.91 | 7627.594 | 6629.126 | 5558.432 | 9423.679 | 6064.946 | 5601.897 | 6007.78 | 6409.938 |
| 249 | 5711.869 | 8550.998 | 5263.048 | 2685.352 | 11657.998 | 5928.91 | 7621.292 | 6629.126 | 5554.027 | 9419.111 | 6064.946 | 5596.841 | 6002.032 | 6409.938 |
| 250 | 5704.696 | 8547.79 | 5257.024 | 2683.255 | 11657.998 | 5928.91 | 7615.024 | 6629.126 | 5549.644 | 9414.548 | 6064.946 | 5593.055 | 5996.31 | 6409.938 |
| 251 | 5697.564 | 8544.588 | 5251.043 | 2681.162 | 11657.998 | 5928.91 | 7608.788 | 6629.126 | 5545.284 | 9409.99 | 6064.946 | 5588.015 | 5990.616 | 6409.938 |
| 252 | 5690.475 | 8541.392 | 5245.107 | 2679.072 | 11657.998 | 5928.91 | 7602.584 | 6629.126 | 5540.947 | 9405.196 | 6064.946 | 5584.241 | 5984.948 | 6409.938 |
| 253 | 5683.426 | 8538.201 | 5239.214 | 2676.986 | 11657.998 | 5928.91 | 7596.412 | 6629.126 | 5536.631 | 9400.647 | 6064.946 | 5579.217 | 5979.307 | 6409.938 |
| 254 | 5676.418 | 8535.015 | 5233.364 | 2674.903 | 11657.998 | 5928.91 | 7590.272 | 6629.126 | 5532.337 | 9396.102 | 6064.946 | 5575.455 | 5973.692 | 6409.938 |
| 255 | 5669.451 | 8531.835 | 5227.557 | 2672.823 | 11657.998 | 5928.91 | 7584.164 | 6629.126 | 5528.065 | 9391.561 | 6064.946 | 5571.698 | 5968.103 | 6409.938 |
| 256 | 5662.523 | 8528.661 | 5221.793 | 2670.746 | 11657.998 | 5928.91 | 7578.086 | 6629.126 | 5523.815 | 9387.025 | 6064.946 | 5566.697 | 5962.539 | 6409.938 |
| 257 | 5655.635 | 8525.492 | 5216.071 | 2668.672 | 11657.998 | 5928.91 | 7572.04 | 6629.126 | 5519.586 | 9382.254 | 6064.946 | 5562.951 | 5957.001 | 6409.938 |
| 258 | 5648.786 | 8522.328 | 5210.392 | 2666.602 | 11657.998 | 5928.91 | 7566.023 | 6629.126 | 5515.377 | 9377.965 | 6064.946 | 5557.965 | 5951.488 | 6409.938 |
| 259 | 5641.975 | 8519.169 | 5204.755 | 2664.535 | 11657.998 | 5928.91 | 7560.037 | 6629.126 | 5511.19 | 9373.442 | 6064.946 | 5554.232 | 5946 | 6409.938 |
| 260 | 5635.203 | 8516.016 | 5199.16 | 2662.471 | 11657.998 | 5928.91 | 7554.081 | 6629.126 | 5507.023 | 9368.923 | 6064.946 | 5550.503 | 5940.536 | 6409.938 |
| 261 | 5628.469 | 8512.868 | 5193.606 | 2660.668 | 11657.998 | 5928.91 | 7548.155 | 6629.126 | 5502.877 | 9364.646 | 6064.946 | 5545.54 | 5935.098 | 6409.938 |
| 262 | 5621.772 | 8509.725 | 5188.094 | 2658.61 | 11657.998 | 5928.91 | 7542.258 | 6629.126 | 5498.751 | 9360.136 | 6064.946 | 5541.823 | 5929.683 | 6409.938 |
| 263 | 5615.113 | 8506.587 | 5182.622 | 2656.555 | 11657.998 | 5928.91 | 7536.39 | 6629.126 | 5494.645 | 9355.63 | 6064.946 | 5536.875 | 5924.293 | 6409.938 |
| 264 | 5608.49 | 8503.455 | 5177.192 | 2654.76 | 11657.998 | 5928.91 | 7530.551 | 6629.126 | 5490.56 | 9351.365 | 6064.946 | 5533.17 | 5918.926 | 6409.938 |
| 265 | 5601.903 | 8500.328 | 5171.802 | 2652.711 | 11657.998 | 5928.91 | 7524.741 | 6629.126 | 5486.494 | 9346.867 | 6064.946 | 5529.469 | 5913.584 | 6409.938 |
| 266 | 5595.353 | 8497.205 | 5166.453 | 2650.665 | 11657.998 | 5928.91 | 7518.959 | 6629.126 | 5482.447 | 9342.611 | 6064.946 | 5525.774 | 5908.264 | 6409.938 |
| 267 | 5588.839 | 8494.088 | 5160.173 | 2648.878 | 11657.998 | 5928.91 | 7513.205 | 6629.126 | 5478.42 | 9338.358 | 6064.946 | 5520.855 | 5902.968 | 6409.938 |
| 268 | 5582.359 | 8490.976 | 5158.369 | 2646.838 | 11657.998 | 5928.91 | 7507.479 | 6629.126 | 5474.412 | 9334.109 | 6064.946 | 5517.171 | 5897.695 | 6409.938 |
| 269 | 5575.915 | 8487.869 | 5156.568 | 2644.801 | 11657.998 | 5928.91 | 7501.78 | 6629.126 | 5470.423 | 9329.863 | 6064.946 | 5513.492 | 5892.445 | 6409.938 |
| 270 | 5569.506 | 8484.767 | 5154.768 | 2643.022 | 11657.998 | 5928.91 | 7496.109 | 6629.126 | 5466.454 | 9325.622 | 6064.946 | 5508.594 | 5887.218 | 6409.938 |
| 271 | 5563.131 | 8481.669 | 5152.971 | 2640.991 | 11657.998 | 5928.91 | 7490.465 | 6629.126 | 5462.503 | 9321.384 | 6064.946 | 5504.927 | 5882.013 | 6409.938 |
| 272 | 5556.79 | 8478.577 | 5151.176 | 2639.217 | 11657.998 | 5928.91 | 7484.848 | 6629.126 | 5458.57 | 9317.151 | 6064.946 | 5501.264 | 5876.83 | 6409.938 |
| 273 | 5550.482 | 8475.49 | 5149.383 | 2637.192 | 11657.998 | 5928.91 | 7479.257 | 6629.126 | 5454.656 | 9312.921 | 6064.946 | 5497.606 | 5871.67 | 6409.938 |
| 274 | 5544.208 | 8472.407 | 5147.592 | 2635.423 | 11657.998 | 5928.91 | 7473.693 | 6629.126 | 5450.76 | 9308.46 | 6064.946 | 5492.737 | 5866.531 | 6409.938 |
| 275 | 5537.967 | 8469.33 | 5145.804 | 2633.404 | 11657.998 | 5928.91 | 7468.155 | 6629.126 | 5446.882 | 9304.707 | 6064.946 | 5489.091 | 5861.414 | 6409.938 |
| 276 | 5531.759 | 8466.257 | 5144.018 | 2631.639 | 11657.998 | 5928.91 | 7462.643 | 6629.126 | 5443.022 | 9300.254 | 6064.946 | 5485.449 | 5856.319 | 6409.938 |
| 277 | 5525.583 | 8463.189 | 5142.234 | 2629.878 | 11657.998 | 5928.91 | 7457.157 | 6629.126 | 5439.18 | 9296.274 | 6064.946 | 5481.812 | 5851.245 | 6409.938 |
| 278 | 5519.44 | 8460.125 | 5140.452 | 2627.867 | 11657.998 | 5928.91 | 7451.696 | 6629.126 | 5435.356 | 9292.063 | 6064.946 | 5478.18 | 5846.192 | 6409.938 |
| 279 | 5513.328 | 8457.067 | 5138.672 | 2626.11 | 11657.998 | 5928.91 | 7446.261 | 6629.126 | 5431.549 | 9288.09 | 6064.946 | 5473.345 | 5841.161 | 6409.938 |
| 280 | 5507.248 | 8454.013 | 5136.894 | 2624.356 | 11657.998 | 5928.91 | 7440.85 | 6629.126 | 5427.76 | 9283.886 | 6064.946 | 5469.724 | 5836.15 | 6409.938 |
| 281 | 5501.199 | 8450.964 | 5135.119 | 2622.354 | 11657.998 | 5928.91 | 7435.465 | 6629.126 | 5423.987 | 9279.92 | 6064.946 | 5466.108 | 5831.159 | 6409.938 |
| 282 | 5495.181 | 8447.919 | 5133.345 | 2620.604 | 11657.998 | 5928.91 | 7430.104 | 6629.126 | 5420.232 | 9275.723 | 6064.946 | 5462.497 | 5826.19 | 6409.938 |
| 283 | 5489.193 | 8444.879 | 5131.574 | 2618.857 | 11657.998 | 5928.91 | 7424.767 | 6629.126 | 5416.493 | 9271.764 | 6064.946 | 5458.891 | 5821.24 | 6409.938 |
| 284 | 5483.236 | 8441.844 | 5129.805 | 2617.112 | 11657.998 | 5928.91 | 7419.455 | 6629.126 | 5412.772 | 9267.808 | 6064.946 | 5455.289 | 5816.311 | 6409.938 |
| 285 | 5477.31 | 8438.813 | 5128.038 | 2615.121 | 11657.998 | 5928.91 | 7414.167 | 6629.126 | 5409.066 | 9264.088 | 6064.946 | 5451.692 | 5811.402 | 6409.938 |
| 286 | 5471.413 | 8435.787 | 5126.273 | 2613.381 | 11657.998 | 5928.91 | 7408.902 | 6629.126 | 5405.378 | 9260.138 | 6064.946 | 5448.1 | 5806.512 | 6409.938 |
| 287 | 5465.545 | 8432.765 | 5124.511 | 2611.644 | 11657.998 | 5928.91 | 7403.661 | 6629.126 | 5401.706 | 9256.192 | 6064.946 | 5443.318 | 5801.642 | 6409.938 |
| 288 | 5459.707 | 8429.748 | 5122.75 | 2609.909 | 11657.998 | 5928.91 | 7398.444 | 6629.126 | 5398.05 | 9252.249 | 6064.946 | 5439.737 | 5796.792 | 6409.938 |
| 289 | 5453.898 | 8426.735 | 5120.992 | 2608.176 | 11657.998 | 5928.91 | 7393.25 | 6629.126 | 5394.41 | 9248.309 | 6064.946 | 5436.16 | 5791.961 | 6409.938 |
| 290 | 5448.118 | 8423.727 | 5119.236 | 2606.445 | 11657.998 | 5928.91 | 7388.079 | 6629.126 | 5390.786 | 9244.373 | 6064.946 | 5432.589 | 5787.15 | 6409.938 |
| 291 | 5442.366 | 8420.724 | 5117.482 | 2604.717 | 11657.998 | 5928.91 | 7382.93 | 6629.126 | 5387.177 | 9240.44 | 6064.946 | 5429.022 | 5782.357 | 6409.938 |
| 292 | 5436.643 | 8417.724 | 5115.73 | 2602.991 | 11657.998 | 5928.91 | 7377.805 | 6629.126 | 5383.585 | 9236.742 | 6064.946 | 5425.459 | 5777.583 | 6409.938 |
| 293 | 5430.948 | 8414.729 | 5113.98 | 2601.268 | 11657.998 | 5928.91 | 7372.701 | 6629.126 | 5380.008 | 9232.816 | 6064.946 | 5421.902 | 5772.828 | 6409.938 |
| 294 | 5425.28 | 8411.739 | 5112.232 | 2599.546 | 11657.998 | 5928.91 | 7367.621 | 6629.126 | 5376.446 | 9228.893 | 6064.946 | 5418.349 | 5768.092 | 6409.938 |
| 295 | 5419.64 | 8408.753 | 5110.487 | 2597.827 | 11657.998 | 5928.91 | 7362.562 | 6629.126 | 5372.9 | 9225.204 | 6064.946 | 5414.8 | 5763.374 | 6409.938 |
| 296 | 5414.027 | 8405.771 | 5108.743 | 2596.11 | 11657.998 | 5928.91 | 7357.525 | 6629.126 | 5369.369 | 9221.287 | 6064.946 | 5411.257 | 5758.675 | 6409.938 |
| 297 | 5408.442 | 8402.793 | 5107.002 | 2594.396 | 11657.998 | 5928.91 | 7352.51 | 6629.126 | 5365.853 | 9217.604 | 6064.946 | 5407.717 | 5753.994 | 6409.938 |
| 298 | 5402.883 | 8399.82 | 5105.262 | 2592.683 | 11657.998 | 5928.91 | 7347.517 | 6629.126 | 5362.352 | 9213.924 | 6064.946 | 5404.183 | 5749.33 | 6409.938 |
| 299 | 5397.35 | 8396.851 | 5103.525 | 2590.973 | 11657.998 | 5928.91 | 7342.544 | 6629.126 | 5358.866 | 9210.247 | 6064.946 | 5400.653 | 5744.685 | 6409.938 |
| 300 | 5391.845 | 8393.886 | 5101.79 | 2589.266 | 11657.998 | 5928.91 | 7337.594 | 6629.126 | 5355.394 | 9206.572 | 6064.946 | 5397.128 | 5740.057 | 6409.938 |
| 301 | 5386.365 | 8390.926 | 5100.057 | 2587.56 | 11657.998 | 5928.91 | 7332.664 | 6629.126 | 5351.937 | 9202.901 | 6064.946 | 5393.607 | 5735.447 | 6409.938 |
| 302 | 5380.911 | 8387.969 | 5098.326 | 2585.857 | 11657.998 | 5928.91 | 7327.755 | 6629.126 | 5348.495 | 9199.003 | 6064.946 | 5390.091 | 5730.855 | 6409.938 |
| 303 | 5375.483 | 8385.017 | 5096.597 | 2584.398 | 11657.998 | 5928.91 | 7322.867 | 6629.126 | 5345.067 | 9195.338 | 6064.946 | 5386.58 | 5726.28 | 6409.938 |
| 304 | 5370.08 | 8382.069 | 5094.87 | 2582.699 | 11657.998 | 5928.91 | 7317.999 | 6629.126 | 5341.653 | 9191.676 | 6064.946 | 5383.073 | 5721.722 | 6409.938 |
| 305 | 5364.703 | 8379.125 | 5093.146 | 2581.002 | 11657.998 | 5928.91 | 7313.152 | 6629.126 | 5338.253 | 9188.245 | 6064.946 | 5379.571 | 5717.181 | 6409.938 |
| 306 | 5359.351 | 8376.186 | 5091.423 | 2579.308 | 11657.998 | 5928.91 | 7308.326 | 6629.126 | 5334.868 | 9184.588 | 6064.946 | 5376.073 | 5712.657 | 6409.938 |
| 307 | 5354.023 | 8373.25 | 5089.703 | 2577.615 | 11657.998 | 5928.91 | 7303.519 | 6629.126 | 5331.496 | 9181.163 | 6064.946 | 5372.58 | 5708.15 | 6409.938 |
| 308 | 5348.72 | 8370.318 | 5087.984 | 2576.166 | 11657.998 | 5928.91 | 7298.732 | 6629.126 | 5328.138 | 9177.512 | 6064.946 | 5369.091 | 5703.66 | 6409.938 |
| 309 | 5343.442 | 8367.391 | 5086.268 | 2574.478 | 11657.998 | 5928.91 | 7293.965 | 6629.126 | 5324.794 | 9174.091 | 6064.946 | 5366.768 | 5699.187 | 6409.938 |
| 310 | 5338.188 | 8364.467 | 5084.553 | 2572.792 | 11657.998 | 5928.91 | 7289.218 | 6629.126 | 5321.463 | 9170.446 | 6064.946 | 5363.286 | 5694.729 | 6409.938 |
| 311 | 5332.958 | 8361.548 | 5082.841 | 2571.348 | 11657.998 | 5928.91 | 7284.49 | 6629.126 | 5318.146 | 9167.031 | 6064.946 | 5359.81 | 5690.289 | 6409.938 |
| 312 | 5327.751 | 8358.633 | 5081.131 | 2569.666 | 11657.998 | 5928.91 | 7279.781 | 6629.126 | 5314.843 | 9163.391 | 6064.946 | 5356.338 | 5685.864 | 6409.938 |
| 313 | 5322.569 | 8355.721 | 5079.423 | 2567.987 | 11657.998 | 5928.91 | 7275.092 | 6629.126 | 5311.552 | 9160.208 | 6064.946 | 5352.87 | 5681.456 | 6409.938 |
| 314 | 5317.409 | 8352.814 | 5077.717 | 2566.548 | 11657.998 | 5928.91 | 7270.422 | 6629.126 | 5308.275 | 9156.574 | 6064.946 | 5349.407 | 5677.063 | 6409.938 |
| 315 | 5312.273 | 8349.91 | 5076.013 | 2564.873 | 11657.998 | 5928.91 | 7265.77 | 6629.126 | 5305.011 | 9153.169 | 6064.946 | 5345.948 | 5672.687 | 6409.938 |
| 316 | 5307.16 | 8347.01 | 5074.311 | 2563.438 | 11657.998 | 5928.91 | 7261.138 | 6629.126 | 5301.76 | 9149.54 | 6064.946 | 5343.645 | 5668.326 | 6409.938 |
| 317 | 5302.07 | 8344.115 | 5072.611 | 2561.766 | 11657.998 | 5928.91 | 7256.524 | 6629.126 | 5298.522 | 9146.141 | 6064.946 | 5340.194 | 5663.981 | 6409.938 |
| 318 | 5297.003 | 8341.223 | 5070.913 | 2560.335 | 11657.998 | 5928.91 | 7251.928 | 6629.126 | 5295.297 | 9142.97 | 6064.946 | 5336.747 | 5659.651 | 6409.938 |
| 319 | 5291.958 | 8338.335 | 5069.217 | 2558.668 | 11657.998 | 5928.91 | 7247.351 | 6629.126 | 5292.084 | 9139.576 | 6064.946 | 5333.305 | 5655.337 | 6409.938 |
| 320 | 5286.935 | 8335.451 | 5067.523 | 2557.24 | 11657.998 | 5928.91 | 7242.792 | 6629.126 | 5288.884 | 9136.184 | 6064.946 | 5329.867 | 5651.038 | 6409.938 |
| 321 | 5281.935 | 8332.571 | 5065.831 | 2555.576 | 11657.998 | 5928.91 | 7238.251 | 6629.126 | 5285.697 | 9132.794 | 6064.946 | 5326.433 | 5646.755 | 6409.938 |
| 322 | 5276.957 | 8329.694 | 5064.142 | 2554.152 | 11657.998 | 5928.91 | 7233.728 | 6629.126 | 5282.522 | 9129.407 | 6064.946 | 5324.147 | 5642.486 | 6409.938 |
| 323 | 5272 | 8326.822 | 5062.454 | 2552.492 | 11657.998 | 5928.91 | 7229.223 | 6629.126 | 5279.359 | 9126.248 | 6064.946 | 5320.721 | 5638.233 | 6409.938 |
| 324 | 5267.065 | 8323.953 | 5060.768 | 2551.072 | 11657.998 | 5928.91 | 7224.736 | 6629.126 | 5276.209 | 9123.091 | 6064.946 | 5317.299 | 5633.994 | 6409.938 |
| 325 | 5262.151 | 8321.088 | 5059.084 | 2549.416 | 11657.998 | 5928.91 | 7220.266 | 6629.126 | 5273.07 | 9119.712 | 6064.946 | 5313.882 | 5629.77 | 6409.938 |
| 326 | 5257.259 | 8318.227 | 5057.403 | 2547.999 | 11657.998 | 5928.91 | 7215.813 | 6629.126 | 5269.944 | 9116.334 | 6064.946 | 5310.469 | 5625.561 | 6409.938 |
| 327 | 5252.388 | 8315.369 | 5055.723 | 2546.347 | 11657.998 | 5928.91 | 7211.378 | 6629.126 | 5266.83 | 9113.184 | 6064.946 | 5308.196 | 5621.366 | 6409.938 |
| 328 | 5247.537 | 8312.515 | 5054.045 | 2544.933 | 11657.998 | 5928.91 | 7206.96 | 6629.126 | 5263.728 | 9110.037 | 6064.946 | 5304.79 | 5617.186 | 6409.938 |
| 329 | 5242.708 | 8309.665 | 5052.37 | 2543.52 | 11657.998 | 5928.91 | 7202.559 | 6629.126 | 5260.637 | 9106.666 | 6064.946 | 5301.389 | 5613.021 | 6409.938 |
| 330 | 5237.899 | 8306.819 | 5050.696 | 2541.875 | 11657.998 | 5928.91 | 7198.175 | 6629.126 | 5257.558 | 9103.748 | 6064.946 | 5297.992 | 5608.869 | 6409.938 |
| 331 | 5233.11 | 8303.976 | 5049.025 | 2540.466 | 11657.998 | 5928.91 | 7193.807 | 6629.126 | 5254.491 | 9100.382 | 6064.946 | 5295.73 | 5604.732 | 6409.938 |
| 332 | 5228.342 | 8301.137 | 5047.355 | 2539.058 | 11657.998 | 5928.91 | 7189.457 | 6629.126 | 5251.436 | 9097.467 | 6064.946 | 5292.341 | 5600.609 | 6409.938 |
| 333 | 5223.594 | 8298.302 | 5045.687 | 2537.652 | 11657.998 | 5928.91 | 7185.123 | 6629.126 | 5248.392 | 9094.106 | 6064.946 | 5288.955 | 5596.499 | 6409.938 |
| 334 | 5218.866 | 8295.47 | 5044.022 | 2536.014 | 11657.998 | 5928.91 | 7180.805 | 6629.126 | 5245.359 | 9090.972 | 6064.946 | 5286.701 | 5592.404 | 6409.938 |
| 335 | 5214.158 | 8292.642 | 5042.358 | 2534.611 | 11657.998 | 5928.91 | 7176.504 | 6629.126 | 5242.338 | 9088.063 | 6064.946 | 5283.323 | 5588.322 | 6409.938 |
| 336 | 5209.47 | 8289.817 | 5040.696 | 2533.211 | 11657.998 | 5928.91 | 7172.219 | 6629.126 | 5239.328 | 9084.933 | 6064.946 | 5279.949 | 5584.255 | 6409.938 |
| 337 | 5204.801 | 8286.996 | 5039.037 | 2531.811 | 11657.998 | 5928.91 | 7167.95 | 6629.126 | 5236.329 | 9081.581 | 6064.946 | 5277.702 | 5580.2 | 6409.938 |
| 338 | 5200.151 | 8284.178 | 5037.379 | 2530.18 | 11657.998 | 5928.91 | 7163.697 | 6629.126 | 5233.341 | 9078.678 | 6064.946 | 5274.336 | 5576.16 | 6409.938 |
| 339 | 5195.521 | 8281.365 | 5035.723 | 2528.784 | 11657.998 | 5928.91 | 7159.459 | 6629.126 | 5230.365 | 9075.554 | 6064.946 | 5270.973 | 5572.132 | 6409.938 |
| 340 | 5190.91 | 8278.554 | 5034.07 | 2527.39 | 11657.998 | 5928.91 | 7155.238 | 6629.126 | 5227.399 | 9072.655 | 6064.946 | 5267.615 | 5568.118 | 6409.938 |
| 341 | 5186.317 | 8275.747 | 5032.418 | 2525.997 | 11657.998 | 5928.91 | 7151.032 | 6629.126 | 5224.444 | 9069.536 | 6064.946 | 5265.379 | 5564.118 | 6409.938 |
| 342 | 5181.744 | 8272.944 | 5030.768 | 2524.605 | 11657.998 | 5928.91 | 7146.842 | 6629.126 | 5221.5 | 9066.863 | 6064.946 | 5262.028 | 5560.13 | 6409.938 |
| 343 | 5177.189 | 8270.144 | 5029.12 | 2523.215 | 11657.998 | 5928.91 | 7142.667 | 6629.126 | 5218.566 | 9063.747 | 6064.946 | 5259.796 | 5556.156 | 6409.938 |
| 344 | 5172.653 | 8267.348 | 5027.475 | 2521.827 | 11657.998 | 5928.91 | 7138.508 | 6629.126 | 5215.643 | 9060.856 | 6064.946 | 5256.453 | 5552.194 | 6409.938 |
| 345 | 5168.135 | 8264.555 | 5025.831 | 2520.209 | 11657.998 | 5928.91 | 7134.364 | 6629.126 | 5212.731 | 9057.744 | 6064.946 | 5253.113 | 5548.246 | 6409.938 |
| 346 | 5163.636 | 8261.765 | 5024.189 | 2518.824 | 11657.998 | 5928.91 | 7130.234 | 6629.126 | 5209.829 | 9055.079 | 6064.946 | 5250.889 | 5544.31 | 6409.938 |
| 347 | 5159.154 | 8258.979 | 5022.549 | 2517.44 | 11657.998 | 5928.91 | 7126.12 | 6629.126 | 5206.938 | 9051.971 | 6064.946 | 5247.557 | 5540.387 | 6409.938 |
| 348 | 5154.691 | 8256.197 | 5020.911 | 2516.058 | 11657.998 | 5928.91 | 7122.021 | 6629.126 | 5204.057 | 9049.309 | 6064.946 | 5244.228 | 5536.476 | 6409.938 |
| 349 | 5150.245 | 8253.417 | 5019.275 | 2514.678 | 11657.998 | 5928.91 | 7117.937 | 6629.126 | 5201.186 | 9046.205 | 6064.946 | 5242.012 | 5532.578 | 6409.938 |
| 350 | 5145.817 | 8250.642 | 5017.641 | 2513.299 | 11657.998 | 5928.91 | 7113.867 | 6629.126 | 5198.326 | 9043.546 | 6064.946 | 5238.691 | 5528.693 | 6409.938 |
| 351 | 5141.407 | 8247.869 | 5016.009 | 2511.921 | 11657.998 | 5928.91 | 7109.812 | 6629.126 | 5195.475 | 9040.668 | 6064.946 | 5236.479 | 5524.82 | 6409.938 |
| 352 | 5137.014 | 8245.1 | 5014.379 | 2510.545 | 11657.998 | 5928.91 | 7105.771 | 6629.126 | 5192.635 | 9037.791 | 6064.946 | 5233.165 | 5520.959 | 6409.938 |
| 353 | 5132.639 | 8242.334 | 5012.75 | 2509.171 | 11657.998 | 5928.91 | 7101.745 | 6629.126 | 5189.805 | 9034.916 | 6064.946 | 5229.855 | 5517.111 | 6409.938 |
| 354 | 5128.281 | 8239.572 | 5011.124 | 2507.798 | 11657.998 | 5928.91 | 7097.733 | 6629.126 | 5186.984 | 9032.264 | 6064.946 | 5227.65 | 5513.275 | 6409.938 |
| 355 | 5123.94 | 8236.813 | 5009.5 | 2506.426 | 11657.998 | 5928.91 | 7093.736 | 6629.126 | 5184.174 | 9029.393 | 6064.946 | 5224.347 | 5509.451 | 6409.938 |
| 356 | 5119.616 | 8234.057 | 5007.877 | 2505.056 | 11657.998 | 5928.91 | 7089.752 | 6629.126 | 5181.373 | 9026.744 | 6064.946 | 5222.147 | 5505.639 | 6409.938 |
| 357 | 5115.308 | 8231.305 | 5006.257 | 2503.688 | 11657.998 | 5928.91 | 7085.783 | 6629.126 | 5178.582 | 9024.097 | 6064.946 | 5218.851 | 5501.838 | 6409.938 |
| 358 | 5111.018 | 8228.556 | 5004.638 | 2502.548 | 11657.998 | 5928.91 | 7081.827 | 6629.126 | 5175.801 | 9021.231 | 6064.946 | 5216.656 | 5498.05 | 6409.938 |
| 359 | 5106.744 | 8225.81 | 5003.021 | 2501.182 | 11657.998 | 5928.91 | 7077.886 | 6629.126 | 5173.03 | 9018.587 | 6064.946 | 5213.367 | 5494.273 | 6409.938 |
| 360 | 5102.487 | 8223.067 | 5001.407 | 2499.818 | 11657.998 | 5928.91 | 7073.958 | 6629.126 | 5170.268 | 9015.724 | 6064.946 | 5210.082 | 5490.509 | 6409.938 |
| 361 | 5098.246 | 8220.328 | 4999.794 | 2498.455 | 11657.998 | 5928.91 | 7070.044 | 6629.126 | 5167.515 | 9013.083 | 6064.946 | 5207.894 | 5486.755 | 6409.938 |
| 362 | 5094.021 | 8217.592 | 4998.183 | 2497.094 | 11657.998 | 5928.91 | 7066.143 | 6629.126 | 5164.772 | 9010.664 | 6064.946 | 5204.616 | 5483.014 | 6409.938 |
| 363 | 5089.812 | 8214.859 | 4996.574 | 2495.734 | 11657.998 | 5928.91 | 7062.256 | 6629.126 | 5162.038 | 9007.806 | 6064.946 | 5202.433 | 5479.284 | 6409.938 |
| 364 | 5085.62 | 8212.129 | 4994.967 | 2494.376 | 11657.998 | 5928.91 | 7058.382 | 6629.126 | 5159.314 | 9005.17 | 6064.946 | 5199.162 | 5475.565 | 6409.938 |
| 365 | 5081.443 | 8209.402 | 4993.362 | 2493.245 | 11657.998 | 5928.91 | 7054.521 | 6629.126 | 5156.599 | 9002.536 | 6064.946 | 5196.983 | 5471.857 | 6409.938 |
| 366 | 5077.282 | 8206.679 | 4991.759 | 2491.889 | 11657.998 | 5928.91 | 7050.674 | 6629.126 | 5153.893 | 8999.903 | 6064.946 | 5193.719 | 5468.161 | 6409.938 |
| 367 | 5073.137 | 8203.959 | 4990.157 | 2490.535 | 11657.998 | 5928.91 | 7046.84 | 6629.126 | 5151.196 | 8997.49 | 6064.946 | 5191.545 | 5464.476 | 6409.938 |
| 368 | 5069.008 | 8201.242 | 4988.558 | 2489.183 | 11657.998 | 5928.91 | 7043.019 | 6629.126 | 5148.508 | 8994.86 | 6064.946 | 5188.287 | 5460.803 | 6409.938 |
| 369 | 5064.894 | 8198.528 | 4986.96 | 2488.056 | 11657.998 | 5928.91 | 7039.211 | 6629.126 | 5145.829 | 8992.231 | 6064.946 | 5186.117 | 5457.14 | 6409.938 |
| 370 | 5060.795 | 8195.818 | 4985.365 | 2486.706 | 11657.998 | 5928.91 | 7035.416 | 6629.126 | 5143.159 | 8989.823 | 6064.946 | 5182.867 | 5453.488 | 6409.938 |
| 371 | 5056.712 | 8193.11 | 4983.771 | 2485.358 | 11657.998 | 5928.91 | 7031.633 | 6629.126 | 5140.498 | 8987.198 | 6064.946 | 5180.702 | 5449.847 | 6409.938 |
| 372 | 5052.644 | 8190.406 | 4982.179 | 2484.011 | 11657.998 | 5928.91 | 7027.864 | 6629.126 | 5137.846 | 8984.792 | 6064.946 | 5177.458 | 5446.218 | 6409.938 |
| 373 | 5048.591 | 8187.704 | 4980.589 | 2482.889 | 11657.998 | 5928.91 | 7024.107 | 6629.126 | 5135.203 | 8982.388 | 6064.946 | 5175.297 | 5442.598 | 6409.938 |
| 374 | 5044.553 | 8185.006 | 4979.001 | 2481.545 | 11657.998 | 5928.91 | 7020.362 | 6629.126 | 5132.568 | 8979.767 | 6064.946 | 5172.06 | 5438.99 | 6409.938 |
| 375 | 5040.53 | 8182.311 | 4977.415 | 2480.202 | 11657.998 | 5928.91 | 7016.63 | 6629.126 | 5129.943 | 8977.365 | 6064.946 | 5169.904 | 5435.392 | 6409.938 |
| 376 | 5036.521 | 8179.619 | 4975.83 | 2479.084 | 11657.998 | 5928.91 | 7012.911 | 6629.126 | 5127.325 | 8974.965 | 6064.946 | 5167.75 | 5431.805 | 6409.938 |
| 377 | 5032.528 | 8176.93 | 4974.248 | 2477.744 | 11657.998 | 5928.91 | 7009.203 | 6629.126 | 5124.717 | 8972.566 | 6064.946 | 5164.522 | 5428.229 | 6409.938 |
| 378 | 5028.548 | 8174.244 | 4972.667 | 2476.405 | 11657.998 | 5928.91 | 7005.508 | 6629.126 | 5122.117 | 8969.95 | 6064.946 | 5162.373 | 5424.663 | 6409.938 |
| 379 | 5024.584 | 8171.561 | 4971.089 | 2475.29 | 11657.998 | 5928.91 | 7001.826 | 6629.126 | 5119.525 | 8967.772 | 6064.946 | 5159.151 | 5421.107 | 6409.938 |
| 380 | 5020.633 | 8168.881 | 4969.512 | 2473.954 | 11657.998 | 5928.91 | 6998.155 | 6629.126 | 5116.942 | 8965.377 | 6064.946 | 5157.006 | 5417.562 | 6409.938 |
| 381 | 5016.697 | 8166.204 | 4967.937 | 2472.842 | 11657.998 | 5928.91 | 6994.496 | 6629.126 | 5114.367 | 8962.765 | 6064.946 | 5153.792 | 5414.027 | 6409.938 |
| 382 | 5012.776 | 8163.53 | 4966.364 | 2471.508 | 11657.998 | 5928.91 | 6990.85 | 6629.126 | 5111.8 | 8960.59 | 6064.946 | 5151.651 | 5410.502 | 6409.938 |
| 383 | 5008.868 | 8160.859 | 4964.793 | 2470.176 | 11657.998 | 5928.91 | 6987.215 | 6629.126 | 5109.242 | 8958.199 | 6064.946 | 5149.512 | 5406.988 | 6409.938 |
| 384 | 5004.974 | 8158.191 | 4963.223 | 2469.067 | 11657.998 | 5928.91 | 6983.592 | 6629.126 | 5106.692 | 8956.026 | 6064.946 | 5146.307 | 5403.483 | 6409.938 |
| 385 | 5001.094 | 8155.526 | 4961.656 | 2467.738 | 11657.998 | 5928.91 | 6979.98 | 6629.126 | 5104.15 | 8953.854 | 6064.946 | 5144.173 | 5399.989 | 6409.938 |
| 386 | 4997.228 | 8152.864 | 4960.09 | 2466.631 | 11657.998 | 5928.91 | 6976.381 | 6629.126 | 5101.616 | 8951.25 | 6064.946 | 5140.974 | 5396.504 | 6409.938 |
| 387 | 4993.376 | 8150.205 | 4958.526 | 2465.304 | 11657.998 | 5928.91 | 6972.793 | 6629.126 | 5099.09 | 8949.08 | 6064.946 | 5138.844 | 5393.03 | 6409.938 |
| 388 | 4989.537 | 8147.549 | 4956.964 | 2464.199 | 11657.998 | 5928.91 | 6969.216 | 6629.126 | 5096.572 | 8946.912 | 6064.946 | 5136.716 | 5389.565 | 6409.938 |
| 389 | 4985.712 | 8144.896 | 4955.404 | 2462.875 | 11657.998 | 5928.91 | 6965.651 | 6629.126 | 5094.062 | 8944.745 | 6064.946 | 5133.526 | 5386.111 | 6409.938 |
| 390 | 4981.901 | 8142.246 | 4953.846 | 2461.773 | 11657.998 | 5928.91 | 6962.097 | 6629.126 | 5091.561 | 8942.578 | 6064.946 | 5131.403 | 5382.666 | 6409.938 |
| 391 | 4978.102 | 8139.599 | 4952.289 | 2460.451 | 11657.998 | 5928.91 | 6958.555 | 6629.126 | 5089.066 | 8940.197 | 6064.946 | 5128.22 | 5379.23 | 6409.938 |
| 392 | 4974.318 | 8136.954 | 4950.735 | 2459.351 | 11657.998 | 5928.91 | 6955.024 | 6629.126 | 5086.58 | 8938.033 | 6064.946 | 5126.1 | 5375.805 | 6409.938 |
| 393 | 4970.546 | 8134.313 | 4949.182 | 2458.032 | 11657.998 | 5928.91 | 6951.504 | 6629.126 | 5084.102 | 8935.87 | 6064.946 | 5123.983 | 5372.389 | 6409.938 |
| 394 | 4966.787 | 8131.674 | 4947.631 | 2456.934 | 11657.998 | 5928.91 | 6947.995 | 6629.126 | 5081.631 | 8933.708 | 6064.946 | 5120.809 | 5368.982 | 6409.938 |
| 395 | 4963.042 | 8129.038 | 4946.082 | 2455.836 | 11657.998 | 5928.91 | 6944.497 | 6629.126 | 5079.168 | 8931.547 | 6064.946 | 5118.696 | 5365.586 | 6409.938 |
| 396 | 4959.309 | 8126.405 | 4944.535 | 2454.521 | 11657.998 | 5928.91 | 6941.01 | 6629.126 | 5076.713 | 8929.387 | 6064.946 | 5116.584 | 5362.198 | 6409.938 |
| 397 | 4955.589 | 8123.775 | 4942.989 | 2453.426 | 11657.998 | 5928.91 | 6937.534 | 6629.126 | 5074.265 | 8927.444 | 6064.946 | 5113.42 | 5358.82 | 6409.938 |
| 398 | 4951.882 | 8121.148 | 4941.446 | 2452.113 | 11657.998 | 5928.91 | 6934.069 | 6629.126 | 5071.825 | 8925.07 | 6064.946 | 5111.313 | 5355.451 | 6409.938 |
| 399 | 4948.188 | 8118.524 | 4939.904 | 2451.021 | 11657.998 | 5928.91 | 6930.615 | 6629.126 | 5069.392 | 8922.913 | 6064.946 | 5109.207 | 5352.092 | 6409.938 |
| 400 | 4944.506 | 8115.902 | 4938.364 | 2449.929 | 11657.998 | 5928.91 | 6927.171 | 6629.126 | 5066.967 | 8920.973 | 6064.946 | 5106.052 | 5348.741 | 6409.938 |
| 401 | 4940.837 | 8113.283 | 4936.826 | 2448.62 | 11657.998 | 5928.91 | 6923.738 | 6629.126 | 5064.549 | 8918.818 | 6064.946 | 5103.951 | 5345.4 | 6409.938 |
| 402 | 4937.181 | 8110.667 | 4935.29 | 2447.53 | 11657.998 | 5928.91 | 6920.316 | 6629.126 | 5062.138 | 8916.88 | 6064.946 | 5101.851 | 5342.068 | 6409.938 |
| 403 | 4933.536 | 8108.054 | 4933.755 | 2446.441 | 11657.998 | 5928.91 | 6916.904 | 6629.126 | 5059.735 | 8914.942 | 6064.946 | 5098.705 | 5338.745 | 6409.938 |
| 404 | 4929.904 | 8105.444 | 4932.222 | 2445.136 | 11657.998 | 5928.91 | 6913.503 | 6629.126 | 5057.339 | 8912.791 | 6064.946 | 5096.61 | 5335.431 | 6409.938 |
| 405 | 4926.285 | 8102.836 | 4930.691 | 2444.049 | 11657.998 | 5928.91 | 6910.112 | 6629.126 | 5054.95 | 8910.855 | 6064.946 | 5094.516 | 5332.126 | 6409.938 |
| 406 | 4922.677 | 8100.232 | 4929.162 | 2442.964 | 11657.998 | 5928.91 | 6906.731 | 6629.126 | 5052.569 | 8908.92 | 6064.946 | 5092.425 | 5328.83 | 6409.938 |
| 407 | 4919.082 | 8097.629 | 4927.635 | 2441.662 | 11657.998 | 5928.91 | 6903.361 | 6629.126 | 5050.195 | 8906.986 | 6064.946 | 5089.29 | 5325.543 | 6409.938 |
| 408 | 4915.498 | 8095.03 | 4926.11 | 2440.579 | 11657.998 | 5928.91 | 6900.001 | 6629.126 | 5047.828 | 8905.052 | 6064.946 | 5087.203 | 5322.265 | 6409.938 |
| 409 | 4911.927 | 8092.434 | 4924.586 | 2439.496 | 11657.998 | 5928.91 | 6896.651 | 6629.126 | 5045.467 | 8903.12 | 6064.946 | 5085.117 | 5318.995 | 6409.938 |
| 410 | 4908.367 | 8089.84 | 4923.064 | 2438.198 | 11657.998 | 5928.91 | 6893.311 | 6629.126 | 5043.114 | 8901.188 | 6064.946 | 5081.991 | 5315.735 | 6409.938 |
| 411 | 4904.819 | 8087.249 | 4921.544 | 2437.118 | 11657.998 | 5928.91 | 6889.982 | 6629.126 | 5040.768 | 8899.258 | 6064.946 | 5079.91 | 5312.483 | 6409.938 |
| 412 | 4901.283 | 8084.66 | 4920.025 | 2436.038 | 11657.998 | 5928.91 | 6886.662 | 6629.126 | 5038.429 | 8897.113 | 6064.946 | 5077.83 | 5309.239 | 6409.938 |
| 413 | 4897.759 | 8082.075 | 4918.509 | 2434.96 | 11657.998 | 5928.91 | 6883.352 | 6629.126 | 5036.097 | 8895.613 | 6064.946 | 5075.752 | 5306.004 | 6409.938 |
| 414 | 4894.246 | 8079.492 | 4916.994 | 2433.882 | 11657.998 | 5928.91 | 6880.052 | 6629.126 | 5033.772 | 8893.685 | 6064.946 | 5072.638 | 5302.778 | 6409.938 |
| 415 | 4890.745 | 8076.911 | 4915.481 | 2432.59 | 11657.998 | 5928.91 | 6876.762 | 6629.126 | 5031.453 | 8891.543 | 6064.946 | 5070.564 | 5299.56 | 6409.938 |
| 416 | 4887.255 | 8074.334 | 4913.97 | 2431.515 | 11657.998 | 5928.91 | 6873.482 | 6629.126 | 5029.142 | 8890.045 | 6064.946 | 5068.492 | 5296.351 | 6409.938 |
| 417 | 4883.776 | 8071.759 | 4912.46 | 2430.44 | 11657.998 | 5928.91 | 6870.211 | 6629.126 | 5026.837 | 8888.119 | 6064.946 | 5066.422 | 5293.15 | 6409.938 |
| 418 | 4880.309 | 8069.186 | 4910.953 | 2429.367 | 11657.998 | 5928.91 | 6866.95 | 6629.126 | 5024.539 | 8886.407 | 6064.946 | 5063.319 | 5289.957 | 6409.938 |
| 419 | 4876.853 | 8066.617 | 4909.447 | 2428.294 | 11657.998 | 5928.91 | 6863.699 | 6629.126 | 5022.247 | 8884.483 | 6064.946 | 5061.253 | 5286.773 | 6409.938 |
| 420 | 4873.408 | 8064.05 | 4907.943 | 2427.008 | 11657.998 | 5928.91 | 6860.457 | 6629.126 | 5019.962 | 8882.773 | 6064.946 | 5059.188 | 5283.597 | 6409.938 |
| 421 | 4869.974 | 8061.485 | 4906.44 | 2425.937 | 11657.998 | 5928.91 | 6857.225 | 6629.126 | 5017.684 | 8881.064 | 6064.946 | 5057.125 | 5280.429 | 6409.938 |
| 422 | 4866.551 | 8058.924 | 4904.94 | 2424.868 | 11657.998 | 5928.91 | 6854.002 | 6629.126 | 5015.413 | 8879.142 | 6064.946 | 5054.034 | 5277.269 | 6409.938 |
| 423 | 4863.14 | 8056.365 | 4903.441 | 2423.799 | 11657.998 | 5928.91 | 6850.788 | 6629.126 | 5013.148 | 8877.434 | 6064.946 | 5051.976 | 5274.118 | 6409.938 |
| 424 | 4859.739 | 8053.808 | 4901.944 | 2422.731 | 11657.998 | 5928.91 | 6847.584 | 6629.126 | 5010.889 | 8875.727 | 6064.946 | 5049.919 | 5270.974 | 6409.938 |
| 425 | 4856.349 | 8051.254 | 4900.449 | 2421.664 | 11657.998 | 5928.91 | 6844.389 | 6629.126 | 5008.637 | 8874.021 | 6064.946 | 5047.863 | 5267.839 | 6409.938 |
| 426 | 4852.97 | 8048.703 | 4898.955 | 2420.599 | 11657.998 | 5928.91 | 6841.204 | 6629.126 | 5006.391 | 8872.315 | 6064.946 | 5045.81 | 5264.711 | 6409.938 |
| 427 | 4849.601 | 8046.154 | 4897.463 | 2419.534 | 11657.998 | 5928.91 | 6838.027 | 6629.126 | 5004.152 | 8870.61 | 6064.946 | 5042.732 | 5261.592 | 6409.938 |
| 428 | 4846.243 | 8043.608 | 4895.973 | 2418.47 | 11657.998 | 5928.91 | 6834.86 | 6629.126 | 5001.919 | 8868.905 | 6064.946 | 5040.683 | 5258.481 | 6409.938 |
| 429 | 4842.896 | 8041.065 | 4894.485 | 2417.407 | 11657.998 | 5928.91 | 6831.702 | 6629.126 | 4999.693 | 8867.201 | 6064.946 | 5038.635 | 5255.377 | 6409.938 |
| 430 | 4839.559 | 8038.524 | 4892.999 | 2416.132 | 11657.998 | 5928.91 | 6828.553 | 6629.126 | 4997.472 | 8865.498 | 6064.946 | 5036.589 | 5252.281 | 6409.938 |
| 431 | 4836.233 | 8035.985 | 4891.514 | 2415.071 | 11657.998 | 5928.91 | 6825.413 | 6629.126 | 4995.258 | 8864.221 | 6064.946 | 5034.544 | 5249.193 | 6409.938 |
| 432 | 4832.917 | 8033.449 | 4890.031 | 2414.011 | 11657.998 | 5928.91 | 6822.281 | 6629.126 | 4993.051 | 8862.519 | 6064.946 | 5031.481 | 5246.113 | 6409.938 |
| 433 | 4829.611 | 8030.916 | 4888.549 | 2412.952 | 11657.998 | 5928.91 | 6819.159 | 6629.126 | 4990.849 | 8860.818 | 6064.946 | 5029.44 | 5243.041 | 6409.938 |
| 434 | 4826.316 | 8028.385 | 4887.07 | 2411.894 | 11657.998 | 5928.91 | 6816.046 | 6629.126 | 4988.654 | 8859.33 | 6064.946 | 5027.402 | 5239.976 | 6409.938 |
| 435 | 4823.031 | 8025.857 | 4885.592 | 2410.836 | 11657.998 | 5928.91 | 6812.941 | 6629.126 | 4986.464 | 8857.629 | 6064.946 | 5025.365 | 5236.919 | 6409.938 |
| 436 | 4819.756 | 8023.331 | 4884.116 | 2409.78 | 11657.998 | 5928.91 | 6809.845 | 6629.126 | 4984.281 | 8856.142 | 6064.946 | 5023.329 | 5233.87 | 6409.938 |
| 437 | 4816.491 | 8020.808 | 4882.641 | 2408.725 | 11657.998 | 5928.91 | 6806.758 | 6629.126 | 4982.104 | 8854.868 | 6064.946 | 5021.296 | 5230.828 | 6409.938 |
| 438 | 4813.236 | 8018.287 | 4881.169 | 2407.67 | 11657.998 | 5928.91 | 6803.679 | 6629.126 | 4979.933 | 8853.17 | 6064.946 | 5018.248 | 5227.793 | 6409.938 |
| 439 | 4809.991 | 8015.769 | 4879.698 | 2406.616 | 11657.998 | 5928.91 | 6800.609 | 6629.126 | 4977.768 | 8851.684 | 6064.946 | 5016.218 | 5224.766 | 6409.938 |
| 440 | 4806.757 | 8013.253 | 4878.229 | 2405.564 | 11657.998 | 5928.91 | 6797.548 | 6629.126 | 4975.609 | 8850.199 | 6064.946 | 5014.19 | 5221.747 | 6409.938 |
| 441 | 4803.532 | 8010.74 | 4876.761 | 2404.722 | 11657.998 | 5928.91 | 6794.495 | 6629.126 | 4973.455 | 8848.714 | 6064.946 | 5012.164 | 5218.735 | 6409.938 |
| 442 | 4800.316 | 8008.229 | 4875.295 | 2403.671 | 11657.998 | 5928.91 | 6791.451 | 6629.126 | 4971.308 | 8847.442 | 6064.946 | 5010.139 | 5215.73 | 6409.938 |
| 443 | 4797.111 | 8005.721 | 4873.831 | 2402.621 | 11657.998 | 5928.91 | 6788.415 | 6629.126 | 4969.167 | 8845.959 | 6064.946 | 5008.116 | 5212.733 | 6409.938 |
| 444 | 4793.915 | 8003.215 | 4872.369 | 2401.572 | 11657.998 | 5928.91 | 6785.387 | 6629.126 | 4967.031 | 8844.475 | 6064.946 | 5006.095 | 5209.743 | 6409.938 |
| 445 | 4790.729 | 8000.712 | 4870.908 | 2400.524 | 11657.998 | 5928.91 | 6782.368 | 6629.126 | 4964.901 | 8842.993 | 6064.946 | 5004.075 | 5206.76 | 6409.938 |
| 446 | 4787.553 | 7998.211 | 4869.449 | 2399.476 | 11657.998 | 5928.91 | 6779.357 | 6629.126 | 4962.777 | 8841.51 | 6064.946 | 5001.048 | 5203.785 | 6409.938 |
| 447 | 4784.386 | 7995.712 | 4867.992 | 2398.43 | 11657.998 | 5928.91 | 6776.354 | 6629.126 | 4960.659 | 8840.24 | 6064.946 | 4999.033 | 5200.816 | 6409.938 |
| 448 | 4781.229 | 7993.216 | 4866.537 | 2397.384 | 11657.998 | 5928.91 | 6773.359 | 6629.126 | 4958.547 | 8838.759 | 6064.946 | 4997.019 | 5197.855 | 6409.938 |
| 449 | 4778.081 | 7990.722 | 4865.083 | 2396.34 | 11657.998 | 5928.91 | 6770.373 | 6629.126 | 4956.44 | 8837.49 | 6064.946 | 4995.006 | 5194.901 | 6409.938 |
| 450 | 4774.942 | 7988.231 | 4863.631 | 2395.296 | 11657.998 | 5928.91 | 6767.395 | 6629.126 | 4954.339 | 8837.49 | 6064.946 | 4992.995 | 5191.954 | 6409.938 |
| 451 | 4771.813 | 7985.742 | 4862.18 | 2394.462 | 11657.998 | 5928.91 | 6764.425 | 6629.126 | 4952.243 | 8837.49 | 6064.946 | 4990.986 | 5189.014 | 6409.938 |
| 452 | 4768.693 | 7983.256 | 4860.731 | 2393.42 | 11657.998 | 5928.91 | 6761.462 | 6629.126 | 4950.153 | 8837.49 | 6064.946 | 4988.978 | 5186.081 | 6409.938 |
| 453 | 4765.582 | 7980.772 | 4859.284 | 2392.379 | 11657.998 | 5928.91 | 6758.508 | 6629.126 | 4948.069 | 8837.49 | 6064.946 | 4986.972 | 5183.156 | 6409.938 |
| 454 | 4762.481 | 7978.29 | 4857.839 | 2391.338 | 11657.998 | 5928.91 | 6755.562 | 6629.126 | 4945.99 | 8837.49 | 6064.946 | 4984.968 | 5180.237 | 6409.938 |
| 455 | 4759.388 | 7975.811 | 4856.395 | 2390.299 | 11657.998 | 5928.91 | 6752.624 | 6629.126 | 4943.917 | 8837.49 | 6064.946 | 4981.964 | 5177.325 | 6409.938 |
| 456 | 4756.305 | 7973.334 | 4854.953 | 2389.261 | 11657.998 | 5928.91 | 6749.693 | 6629.126 | 4941.849 | 8837.49 | 6064.946 | 4979.964 | 5174.42 | 6409.938 |
| 457 | 4753.231 | 7970.86 | 4853.513 | 2388.43 | 11657.998 | 5928.91 | 6746.771 | 6629.126 | 4939.787 | 8837.49 | 6064.946 | 4977.965 | 5171.521 | 6409.938 |
| 458 | 4750.166 | 7968.388 | 4852.075 | 2387.394 | 11657.998 | 5928.91 | 6743.856 | 6629.126 | 4937.73 | 8837.49 | 6064.946 | 4975.968 | 5168.63 | 6409.938 |
| 459 | 4747.109 | 7965.918 | 4850.638 | 2386.358 | 11657.998 | 5928.91 | 6740.949 | 6629.126 | 4935.678 | 8837.49 | 6064.946 | 4973.972 | 5165.745 | 6409.938 |
| 460 | 4744.062 | 7963.45 | 4849.202 | 2385.323 | 11657.998 | 5928.91 | 6738.05 | 6629.126 | 4933.632 | 8837.49 | 6064.946 | 4971.978 | 5162.867 | 6409.938 |
| 461 | 4741.023 | 7960.985 | 4847.769 | 2384.289 | 11657.998 | 5928.91 | 6735.158 | 6629.126 | 4931.591 | 8837.49 | 6064.946 | 4969.986 | 5159.996 | 6409.938 |
| 462 | 4737.993 | 7958.523 | 4846.337 | 2383.462 | 11657.998 | 5928.91 | 6732.274 | 6629.126 | 4929.556 | 8837.49 | 6064.946 | 4967.995 | 5157.131 | 6409.938 |
| 463 | 4734.972 | 7956.062 | 4844.907 | 2382.429 | 11657.998 | 5928.91 | 6729.398 | 6629.126 | 4927.526 | 8837.49 | 6064.946 | 4966.006 | 5154.274 | 6409.938 |
| 464 | 4731.96 | 7953.604 | 4843.478 | 2381.398 | 11657.998 | 5928.91 | 6726.529 | 6629.126 | 4925.501 | 8837.49 | 6064.946 | 4964.018 | 5151.422 | 6409.938 |
| 465 | 4728.956 | 7951.148 | 4842.051 | 2380.367 | 11657.998 | 5928.91 | 6723.667 | 6629.126 | 4923.481 | 8837.49 | 6064.946 | 4962.032 | 5148.578 | 6409.938 |
| 466 | 4725.961 | 7948.695 | 4840.626 | 2379.543 | 11657.998 | 5928.91 | 6720.814 | 6629.126 | 4921.467 | 8837.49 | 6064.946 | 4960.048 | 5145.74 | 6409.938 |
| 467 | 4722.974 | 7946.244 | 4839.202 | 2378.514 | 11657.998 | 5928.91 | 6717.967 | 6629.126 | 4919.458 | 8837.49 | 6064.946 | 4958.065 | 5142.908 | 6409.938 |
| 468 | 4719.996 | 7943.795 | 4837.781 | 2377.486 | 11657.998 | 5928.91 | 6715.128 | 6629.126 | 4917.454 | 8837.49 | 6064.946 | 4956.084 | 5140.083 | 6409.938 |
| 469 | 4717.027 | 7941.348 | 4836.36 | 2376.664 | 11657.998 | 5928.91 | 6712.297 | 6629.126 | 4915.455 | 8837.49 | 6064.946 | 4954.104 | 5137.264 | 6409.938 |
| 470 | 4714.065 | 7938.904 | 4834.942 | 2375.637 | 11657.998 | 5928.91 | 6709.472 | 6629.126 | 4913.461 | 8837.49 | 6064.946 | 4952.126 | 5134.452 | 6409.938 |
| 471 | 4711.113 | 7936.462 | 4833.525 | 2374.611 | 11657.998 | 5928.91 | 6706.655 | 6629.126 | 4911.472 | 8837.49 | 6064.946 | 4950.15 | 5131.647 | 6409.938 |
| 472 | 4708.168 | 7934.022 | 4832.109 | 2373.791 | 11657.998 | 5928.91 | 6703.845 | 6629.126 | 4909.489 | 8837.49 | 6064.946 | 4948.175 | 5128.847 | 6409.938 |
| 473 | 4705.232 | 7931.585 | 4830.696 | 2372.767 | 11657.998 | 5928.91 | 6701.043 | 6629.126 | 4907.51 | 8837.49 | 6064.946 | 4946.201 | 5126.054 | 6409.938 |
| 474 | 4702.304 | 7929.15 | 4829.284 | 2371.744 | 11657.998 | 5928.91 | 6698.248 | 6629.126 | 4905.536 | 8837.49 | 6064.946 | 4944.23 | 5123.267 | 6409.938 |
| 475 | 4699.384 | 7926.717 | 4827.873 | 2370.926 | 11657.998 | 5928.91 | 6695.459 | 6629.126 | 4903.568 | 8837.49 | 6064.946 | 4942.259 | 5120.487 | 6409.938 |
| 476 | 4696.473 | 7924.286 | 4826.465 | 2369.904 | 11657.998 | 5928.91 | 6692.678 | 6629.126 | 4901.604 | 8837.49 | 6064.946 | 4940.291 | 5117.713 | 6409.938 |
| 477 | 4693.569 | 7921.858 | 4825.058 | 2368.884 | 11657.998 | 5928.91 | 6689.904 | 6629.126 | 4899.646 | 8837.49 | 6064.946 | 4938.324 | 5114.945 | 6409.938 |
| 478 | 4690.674 | 7919.432 | 4823.652 | 2368.068 | 11657.998 | 5928.91 | 6687.137 | 6629.126 | 4897.692 | 8837.49 | 6064.946 | 4936.358 | 5112.183 | 6409.938 |
| 479 | 4687.787 | 7917.008 | 4822.248 | 2367.048 | 11657.998 | 5928.91 | 6684.377 | 6629.126 | 4895.743 | 8837.49 | 6064.946 | 4934.394 | 5109.428 | 6409.938 |
| 480 | 4684.907 | 7914.586 | 4820.846 | 2366.03 | 11657.998 | 5928.91 | 6681.625 | 6629.126 | 4893.799 | 8837.49 | 6064.946 | 4932.432 | 5106.678 | 6409.938 |
| 481 | 4682.036 | 7912.167 | 4819.446 | 2365.216 | 11657.998 | 5928.91 | 6678.879 | 6629.126 | 4891.86 | 8837.49 | 6064.946 | 4930.471 | 5103.935 | 6409.938 |
| 482 | 4679.172 | 7909.749 | 4818.047 | 2364.199 | 11657.998 | 5928.91 | 6676.139 | 6629.126 | 4889.926 | 8837.49 | 6064.946 | 4928.512 | 5101.198 | 6409.938 |
| 483 | 4676.317 | 7907.334 | 4816.65 | 2363.386 | 11657.998 | 5928.91 | 6673.407 | 6629.126 | 4887.996 | 8837.49 | 6064.946 | 4926.554 | 5098.466 | 6409.938 |
| 484 | 4673.469 | 7904.921 | 4815.254 | 2362.371 | 11657.998 | 5928.91 | 6670.682 | 6629.126 | 4886.071 | 8837.49 | 6064.946 | 4924.598 | 5095.741 | 6409.938 |
| 485 | 4670.629 | 7902.511 | 4813.86 | 2361.357 | 11657.998 | 5928.91 | 6667.963 | 6629.126 | 4884.151 | 8837.49 | 6064.946 | 4922.643 | 5093.022 | 6409.938 |
| 486 | 4667.797 | 7900.102 | 4812.467 | 2360.546 | 11657.998 | 5928.91 | 6665.252 | 6629.126 | 4882.236 | 8837.49 | 6064.946 | 4920.69 | 5090.309 | 6409.938 |
| 487 | 4664.972 | 7897.696 | 4811.077 | 2359.533 | 11657.998 | 5928.91 | 6662.547 | 6629.126 | 4880.325 | 8837.49 | 6064.946 | 4918.739 | 5087.602 | 6409.938 |
| 488 | 4662.155 | 7895.292 | 4809.687 | 2358.724 | 11657.998 | 5928.91 | 6659.848 | 6629.126 | 4878.42 | 8837.49 | 6064.946 | 4916.789 | 5084.901 | 6409.938 |
| 489 | 4659.346 | 7892.89 | 4808.3 | 2357.712 | 11657.998 | 5928.91 | 6657.157 | 6629.126 | 4876.518 | 8837.49 | 6064.946 | 4914.84 | 5082.205 | 6409.938 |
| 490 | 4656.544 | 7890.49 | 4806.914 | 2356.904 | 11657.998 | 5928.91 | 6654.472 | 6629.126 | 4874.622 | 8837.49 | 6064.946 | 4912.894 | 5079.516 | 6409.938 |
| 491 | 4653.75 | 7888.093 | 4805.53 | 2355.894 | 11657.998 | 5928.91 | 6651.793 | 6629.126 | 4872.73 | 8837.49 | 6064.946 | 4910.948 | 5076.832 | 6409.938 |
| 492 | 4650.963 | 7885.697 | 4804.147 | 2355.087 | 11657.998 | 5928.91 | 6649.122 | 6629.126 | 4870.843 | 8837.49 | 6064.946 | 4909.005 | 5074.154 | 6409.938 |
| 493 | 4648.184 | 7883.304 | 4802.766 | 2354.079 | 11657.998 | 5928.91 | 6646.456 | 6629.126 | 4868.96 | 8837.49 | 6064.946 | 4907.062 | 5071.482 | 6409.938 |
| 494 | 4645.413 | 7880.913 | 4801.386 | 2353.273 | 11657.998 | 5928.91 | 6643.798 | 6629.126 | 4867.082 | 8837.49 | 6064.946 | 4905.122 | 5068.816 | 6409.938 |
| 495 | 4642.648 | 7878.524 | 4800.008 | 2352.267 | 11657.998 | 5928.91 | 6641.145 | 6629.126 | 4865.208 | 8837.49 | 6064.946 | 4903.182 | 5066.155 | 6409.938 |
| 496 | 4639.891 | 7876.137 | 4798.632 | 2351.462 | 11657.998 | 5928.91 | 6638.5 | 6629.126 | 4863.339 | 8837.49 | 6064.946 | 4901.245 | 5063.5 | 6409.938 |
| 497 | 4637.142 | 7873.753 | 4797.257 | 2350.457 | 11657.998 | 5928.91 | 6635.86 | 6629.126 | 4861.474 | 8837.49 | 6064.946 | 4899.309 | 5060.851 | 6409.938 |
| 498 | 4634.399 | 7871.37 | 4795.884 | 2349.654 | 11657.998 | 5928.91 | 6633.228 | 6629.126 | 4859.614 | 8837.49 | 6064.946 | 4897.374 | 5058.208 | 6409.938 |
| 499 | 4631.664 | 7868.99 | 4794.513 | 2348.65 | 11657.998 | 5928.91 | 6630.601 | 6629.126 | 4857.758 | 8837.49 | 6064.946 | 4895.441 | 5055.57 | 6409.938 |
| 500 | 4630.156 | 7866.611 | 4793.143 | 2347.848 | 11657.998 | 5928.91 | 6627.981 | 6629.126 | 4855.907 | 8837.49 | 6064.946 | 4893.51 | 5052.938 | 6409.938 |
| 501 | 4630.156 | 7864.235 | 4791.774 | 2346.846 | 11657.998 | 5928.91 | 6625.367 | 6629.126 | 4854.06 | 8837.49 | 6064.946 | 4891.58 | 5050.311 | 6409.938 |
| 502 | 4630.156 | 7861.861 | 4790.408 | 2346.046 | 11657.998 | 5928.91 | 6622.759 | 6629.126 | 4852.218 | 8837.49 | 6064.946 | 4889.651 | 5047.69 | 6409.938 |
| 503 | 4630.156 | 7859.489 | 4789.042 | 2345.045 | 11657.998 | 5928.91 | 6620.158 | 6629.126 | 4850.379 | 8837.49 | 6064.946 | 4887.724 | 5045.075 | 6409.938 |
| 504 | 4630.156 | 7857.119 | 4787.679 | 2344.246 | 11657.998 | 5928.91 | 6617.563 | 6629.126 | 4848.546 | 8837.49 | 6064.946 | 4886.761 | 5042.464 | 6409.938 |
| 505 | 4630.156 | 7854.751 | 4786.317 | 2343.247 | 11657.998 | 5928.91 | 6614.974 | 6629.126 | 4846.716 | 8837.49 | 6064.946 | 4884.837 | 5039.86 | 6409.938 |
| 506 | 4630.156 | 7852.385 | 4784.956 | 2342.448 | 11657.998 | 5928.91 | 6612.391 | 6629.126 | 4844.891 | 8837.49 | 6064.946 | 4882.913 | 5037.261 | 6409.938 |
| 507 | 4630.156 | 7850.022 | 4783.597 | 2341.65 | 11657.998 | 5928.91 | 6609.815 | 6629.126 | 4843.07 | 8837.49 | 6064.946 | 4880.992 | 5034.667 | 6409.938 |
| 508 | 4630.156 | 7847.66 | 4782.24 | 2340.654 | 11657.998 | 5928.91 | 6607.244 | 6629.126 | 4841.254 | 8837.49 | 6064.946 | 4879.072 | 5032.079 | 6409.938 |
| 509 | 4630.156 | 7845.301 | 4780.885 | 2339.857 | 11657.998 | 5928.91 | 6604.68 | 6629.126 | 4839.441 | 8837.49 | 6064.946 | 4877.153 | 5029.496 | 6409.938 |
| 510 | 4630.156 | 7842.943 | 4779.53 | 2338.862 | 11657.998 | 5928.91 | 6602.122 | 6629.126 | 4837.633 | 8837.49 | 6064.946 | 4875.236 | 5026.919 | 6409.938 |
| 511 | 4630.156 | 7840.588 | 4778.178 | 2338.066 | 11657.998 | 5928.91 | 6599.569 | 6629.126 | 4835.829 | 8837.49 | 6064.946 | 4873.32 | 5024.347 | 6409.938 |
| 512 | 4630.156 | 7838.235 | 4776.827 | 2337.272 | 11657.998 | 5928.91 | 6597.023 | 6629.126 | 4834.029 | 8837.49 | 6064.946 | 4871.406 | 5021.78 | 6409.938 |
| 513 | 4630.156 | 7835.883 | 4775.477 | 2336.279 | 11657.998 | 5928.91 | 6594.483 | 6629.126 | 4832.234 | 8837.49 | 6064.946 | 4869.494 | 5019.219 | 6409.938 |
| 514 | 4630.156 | 7833.534 | 4774.129 | 2335.485 | 11657.998 | 5928.91 | 6591.948 | 6629.126 | 4830.443 | 8837.49 | 6064.946 | 4868.538 | 5016.663 | 6409.938 |
| 515 | 4630.156 | 7831.187 | 4772.783 | 2334.692 | 11657.998 | 5928.91 | 6589.42 | 6629.126 | 4828.655 | 8837.49 | 6064.946 | 4866.627 | 5014.112 | 6409.938 |
| 516 | 4630.156 | 7828.842 | 4771.438 | 2333.701 | 11657.998 | 5928.91 | 6586.897 | 6629.126 | 4826.872 | 8837.49 | 6064.946 | 4864.719 | 5011.566 | 6409.938 |
| 517 | 4630.156 | 7826.499 | 4770.095 | 2332.909 | 11657.998 | 5928.91 | 6584.381 | 6629.126 | 4825.093 | 8837.49 | 6064.946 | 4862.811 | 5009.026 | 6409.938 |
| 518 | 4630.156 | 7824.158 | 4768.754 | 2332.118 | 11657.998 | 5928.91 | 6581.87 | 6629.126 | 4823.318 | 8837.49 | 6064.946 | 4860.905 | 5006.49 | 6409.938 |
| 519 | 4630.156 | 7821.819 | 4767.414 | 2331.129 | 11657.998 | 5928.91 | 6579.365 | 6629.126 | 4821.547 | 8837.49 | 6064.946 | 4859.001 | 5003.96 | 6409.938 |
| 520 | 4630.156 | 7819.482 | 4766.075 | 2330.339 | 11657.998 | 5928.91 | 6576.865 | 6629.126 | 4819.78 | 8837.49 | 6064.946 | 4857.098 | 5001.435 | 6409.938 |
| 521 | 4630.156 | 7817.147 | 4764.738 | 2329.549 | 11657.998 | 5928.91 | 6574.372 | 6629.126 | 4818.018 | 8837.49 | 6064.946 | 4855.197 | 4998.916 | 6409.938 |
| 522 | 4630.156 | 7814.814 | 4763.403 | 2328.563 | 11657.998 | 5928.91 | 6571.884 | 6629.126 | 4816.259 | 8837.49 | 6064.946 | 4854.247 | 4996.401 | 6409.938 |
| 523 | 4630.156 | 7812.483 | 4762.069 | 2327.774 | 11657.998 | 5928.91 | 6569.402 | 6629.126 | 4814.504 | 8837.49 | 6064.946 | 4852.347 | 4993.891 | 6409.938 |
| 524 | 4630.156 | 7810.154 | 4760.736 | 2326.987 | 11657.998 | 5928.91 | 6566.926 | 6629.126 | 4812.753 | 8837.49 | 6064.946 | 4850.45 | 4991.387 | 6409.938 |
| 525 | 4630.156 | 7807.826 | 4759.405 | 2326.002 | 11657.998 | 5928.91 | 6564.455 | 6629.126 | 4811.006 | 8837.49 | 6064.946 | 4848.554 | 4988.887 | 6409.938 |
| 526 | 4630.156 | 7805.501 | 4758.076 | 2325.216 | 11657.998 | 5928.91 | 6561.99 | 6629.126 | 4809.263 | 8837.49 | 6064.946 | 4846.659 | 4986.393 | 6409.938 |
| 527 | 4630.156 | 7803.178 | 4756.748 | 2324.429 | 11657.998 | 5928.91 | 6559.53 | 6629.126 | 4807.524 | 8837.49 | 6064.946 | 4844.766 | 4983.903 | 6409.938 |
| 528 | 4630.156 | 7800.857 | 4755.422 | 2323.644 | 11657.998 | 5928.91 | 6557.077 | 6629.126 | 4805.789 | 8837.49 | 6064.946 | 4842.874 | 4981.419 | 6409.938 |
| 529 | 4630.156 | 7798.538 | 4754.098 | 2322.662 | 11657.998 | 5928.91 | 6554.628 | 6629.126 | 4804.058 | 8837.49 | 6064.946 | 4841.929 | 4978.939 | 6409.938 |
| 530 | 4630.156 | 7796.221 | 4752.775 | 2321.878 | 11657.998 | 5928.91 | 6552.186 | 6629.126 | 4802.331 | 8837.49 | 6064.946 | 4840.039 | 4976.465 | 6409.938 |
| 531 | 4630.156 | 7793.906 | 4751.453 | 2321.094 | 11657.998 | 5928.91 | 6549.748 | 6629.126 | 4800.607 | 8837.49 | 6064.946 | 4838.151 | 4973.995 | 6409.938 |
| 532 | 4630.156 | 7791.593 | 4750.133 | 2320.311 | 11657.998 | 5928.91 | 6547.316 | 6629.126 | 4798.887 | 8837.49 | 6064.946 | 4836.264 | 4971.53 | 6409.938 |
| 533 | 4630.156 | 7789.282 | 4748.814 | 2319.332 | 11657.998 | 5928.91 | 6544.89 | 6629.126 | 4797.171 | 8837.49 | 6064.946 | 4834.379 | 4969.071 | 6409.938 |
| 534 | 4630.156 | 7786.972 | 4747.497 | 2318.55 | 11657.998 | 5928.91 | 6542.469 | 6629.126 | 4795.459 | 8837.49 | 6064.946 | 4832.496 | 4966.615 | 6409.938 |
| 535 | 4630.156 | 7784.665 | 4746.182 | 2317.768 | 11657.998 | 5928.91 | 6540.054 | 6629.126 | 4793.751 | 8837.49 | 6064.946 | 4831.554 | 4964.165 | 6409.938 |
| 536 | 4630.156 | 7782.36 | 4744.868 | 2316.987 | 11657.998 | 5928.91 | 6537.644 | 6629.126 | 4792.047 | 8837.49 | 6064.946 | 4829.673 | 4961.72 | 6409.938 |
| 537 | 4630.156 | 7780.056 | 4743.555 | 2316.011 | 11657.998 | 5928.91 | 6535.239 | 6629.126 | 4790.346 | 8837.49 | 6064.946 | 4827.793 | 4959.279 | 6409.938 |
| 538 | 4630.156 | 7777.755 | 4742.244 | 2315.231 | 11657.998 | 5928.91 | 6532.84 | 6629.126 | 4788.649 | 8837.49 | 6064.946 | 4825.914 | 4956.844 | 6409.938 |
| 539 | 4630.156 | 7775.455 | 4740.935 | 2314.452 | 11657.998 | 5928.91 | 6530.446 | 6629.126 | 4786.956 | 8837.49 | 6064.946 | 4824.037 | 4954.413 | 6409.938 |
| 540 | 4630.156 | 7773.157 | 4739.627 | 2313.673 | 11657.998 | 5928.91 | 6528.057 | 6629.126 | 4785.266 | 8837.49 | 6064.946 | 4822.162 | 4951.986 | 6409.938 |
| 541 | 4630.156 | 7770.862 | 4738.321 | 2312.894 | 11657.998 | 5928.91 | 6525.674 | 6629.126 | 4783.58 | 8837.49 | 6064.946 | 4821.224 | 4949.565 | 6409.938 |
| 542 | 4630.156 | 7768.568 | 4737.016 | 2311.922 | 11657.998 | 5928.91 | 6523.295 | 6629.126 | 4781.898 | 8837.49 | 6064.946 | 4819.351 | 4947.148 | 6409.938 |
| 543 | 4630.156 | 7766.276 | 4735.712 | 2311.145 | 11657.998 | 5928.91 | 6520.922 | 6629.126 | 4780.219 | 8837.49 | 6064.946 | 4817.479 | 4944.736 | 6409.938 |
| 544 | 4630.156 | 7763.986 | 4734.41 | 2310.368 | 11657.998 | 5928.91 | 6518.555 | 6629.126 | 4778.544 | 8837.49 | 6064.946 | 4815.609 | 4942.328 | 6409.938 |
| 545 | 4630.156 | 7761.698 | 4733.11 | 2309.592 | 11657.998 | 5928.91 | 6516.192 | 6629.126 | 4776.873 | 8837.49 | 6064.946 | 4813.74 | 4939.925 | 6409.938 |
| 546 | 4630.156 | 7759.412 | 4731.811 | 2308.816 | 11657.998 | 5928.91 | 6513.835 | 6629.126 | 4775.205 | 8837.49 | 6064.946 | 4812.806 | 4937.527 | 6409.938 |
| 547 | 4630.156 | 7757.127 | 4730.514 | 2308.041 | 11657.998 | 5928.91 | 6511.483 | 6629.126 | 4773.541 | 8837.49 | 6064.946 | 4810.939 | 4935.134 | 6409.938 |
| 548 | 4630.156 | 7754.845 | 4729.218 | 2307.073 | 11657.998 | 5928.91 | 6509.135 | 6629.126 | 4771.881 | 8837.49 | 6064.946 | 4809.073 | 4932.745 | 6409.938 |
| 549 | 4630.156 | 7752.565 | 4727.923 | 2306.299 | 11657.998 | 5928.91 | 6506.793 | 6629.126 | 4770.224 | 8837.49 | 6064.946 | 4807.209 | 4930.36 | 6409.938 |
| 550 | 4630.156 | 7750.286 | 4726.631 | 2305.525 | 11657.998 | 5928.91 | 6504.456 | 6629.126 | 4768.571 | 8837.49 | 6064.946 | 4805.347 | 4927.98 | 6409.938 |
| 551 | 4630.156 | 7748.009 | 4725.339 | 2304.752 | 11657.998 | 5928.91 | 6502.125 | 6629.126 | 4766.921 | 8837.49 | 6064.946 | 4804.416 | 4925.605 | 6409.938 |
| 552 | 4630.156 | 7745.734 | 4724.049 | 2303.98 | 11657.998 | 5928.91 | 6499.798 | 6629.126 | 4765.274 | 8837.49 | 6064.946 | 4802.556 | 4923.234 | 6409.938 |
| 553 | 4630.156 | 7743.461 | 4722.761 | 2303.208 | 11657.998 | 5928.91 | 6497.476 | 6629.126 | 4763.632 | 8837.49 | 6064.946 | 4800.697 | 4920.868 | 6409.938 |
| 554 | 4630.156 | 7741.19 | 4721.474 | 2302.437 | 11657.998 | 5928.91 | 6495.159 | 6629.126 | 4761.992 | 8837.49 | 6064.946 | 4798.839 | 4918.506 | 6409.938 |
| 555 | 4630.156 | 7738.921 | 4720.188 | 2301.666 | 11657.998 | 5928.91 | 6492.847 | 6629.126 | 4760.356 | 8837.49 | 6064.946 | 4797.911 | 4916.148 | 6409.938 |
| 556 | 4630.156 | 7736.654 | 4718.904 | 2300.895 | 11657.998 | 5928.91 | 6490.54 | 6629.126 | 4758.724 | 8837.49 | 6064.946 | 4796.056 | 4913.796 | 6409.938 |
| 557 | 4630.156 | 7734.388 | 4717.622 | 2299.933 | 11657.998 | 5928.91 | 6488.238 | 6629.126 | 4757.095 | 8837.49 | 6064.946 | 4794.202 | 4911.447 | 6409.938 |
| 558 | 4630.156 | 7732.124 | 4716.341 | 2299.164 | 11657.998 | 5928.91 | 6485.941 | 6629.126 | 4755.47 | 8837.49 | 6064.946 | 4792.349 | 4909.103 | 6409.938 |
| 559 | 4630.156 | 7729.863 | 4715.061 | 2298.395 | 11657.998 | 5928.91 | 6483.649 | 6629.126 | 4753.848 | 8837.49 | 6064.946 | 4790.498 | 4906.763 | 6409.938 |
| 560 | 4630.156 | 7727.603 | 4713.783 | 2297.627 | 11657.998 | 5928.91 | 6481.362 | 6629.126 | 4752.229 | 8837.49 | 6064.946 | 4789.573 | 4904.428 | 6409.938 |
| 561 | 4630.156 | 7725.345 | 4712.507 | 2296.859 | 11657.998 | 5928.91 | 6479.079 | 6629.126 | 4750.614 | 8837.49 | 6064.946 | 4787.724 | 4902.097 | 6409.938 |
| 562 | 4630.156 | 7723.088 | 4711.231 | 2296.092 | 11657.998 | 5928.91 | 6476.802 | 6629.126 | 4749.002 | 8837.49 | 6064.946 | 4785.877 | 4899.77 | 6409.938 |
| 563 | 4630.156 | 7720.834 | 4709.958 | 2295.326 | 11657.998 | 5928.91 | 6474.529 | 6629.126 | 4747.393 | 8837.49 | 6064.946 | 4784.031 | 4897.448 | 6409.938 |
| 564 | 4630.156 | 7718.581 | 4708.686 | 2294.559 | 11657.998 | 5928.91 | 6472.261 | 6629.126 | 4745.788 | 8837.49 | 6064.946 | 4783.108 | 4895.13 | 6409.938 |
| 565 | 4630.156 | 7716.33 | 4707.415 | 2293.794 | 11657.998 | 5928.91 | 6469.998 | 6629.126 | 4744.186 | 8837.49 | 6064.946 | 4781.264 | 4892.817 | 6409.938 |
| 566 | 4630.156 | 7714.081 | 4706.146 | 2293.029 | 11657.998 | 5928.91 | 6467.739 | 6629.126 | 4742.588 | 8837.49 | 6064.946 | 4779.422 | 4890.507 | 6409.938 |
| 567 | 4630.156 | 7711.834 | 4704.878 | 2292.264 | 11657.998 | 5928.91 | 6465.485 | 6629.126 | 4740.992 | 8837.49 | 6064.946 | 4777.581 | 4888.202 | 6409.938 |
| 568 | 4630.156 | 7709.589 | 4703.612 | 2291.5 | 11657.998 | 5928.91 | 6463.236 | 6629.126 | 4739.4 | 8837.49 | 6064.946 | 4776.661 | 4885.901 | 6409.938 |
| 569 | 4630.156 | 7707.345 | 4702.347 | 2290.736 | 11657.998 | 5928.91 | 6460.992 | 6629.126 | 4737.812 | 8837.49 | 6064.946 | 4774.822 | 4883.605 | 6409.938 |
| 570 | 4630.156 | 7705.103 | 4701.083 | 2289.973 | 11657.998 | 5928.91 | 6458.752 | 6629.126 | 4736.227 | 8837.49 | 6064.946 | 4772.984 | 4881.312 | 6409.938 |
| 571 | 4630.156 | 7702.863 | 4699.821 | 2289.211 | 11657.998 | 5928.91 | 6456.517 | 6629.126 | 4734.644 | 8837.49 | 6064.946 | 4771.148 | 4879.024 | 6409.938 |
| 572 | 4630.156 | 7700.625 | 4698.561 | 2288.449 | 11657.998 | 5928.91 | 6454.287 | 6629.126 | 4733.066 | 8837.49 | 6064.946 | 4770.231 | 4876.74 | 6409.938 |
| 573 | 4630.156 | 7698.389 | 4697.302 | 2287.687 | 11657.998 | 5928.91 | 6452.061 | 6629.126 | 4731.49 | 8837.49 | 6064.946 | 4768.397 | 4874.46 | 6409.938 |
| 574 | 4630.156 | 7696.154 | 4696.044 | 2286.926 | 11657.998 | 5928.91 | 6449.84 | 6629.126 | 4729.918 | 8837.49 | 6064.946 | 4766.564 | 4872.184 | 6409.938 |
| 575 | 4630.156 | 7693.922 | 4694.788 | 2286.166 | 11657.998 | 5928.91 | 6447.623 | 6629.126 | 4728.348 | 8837.49 | 6064.946 | 4765.648 | 4869.913 | 6409.938 |
| 576 | 4630.156 | 7691.691 | 4693.533 | 2285.406 | 11657.998 | 5928.91 | 6445.411 | 6629.126 | 4726.782 | 8837.49 | 6064.946 | 4763.818 | 4867.645 | 6409.938 |
| 577 | 4630.156 | 7689.461 | 4692.28 | 2284.646 | 11657.998 | 5928.91 | 6443.204 | 6629.126 | 4725.219 | 8837.49 | 6064.946 | 4761.989 | 4865.382 | 6409.938 |
| 578 | 4630.156 | 7687.234 | 4691.028 | 2283.887 | 11657.998 | 5928.91 | 6441.001 | 6629.126 | 4723.66 | 8837.49 | 6064.946 | 4760.161 | 4863.123 | 6409.938 |
| 579 | 4630.156 | 7685.008 | 4689.778 | 2283.129 | 11657.998 | 5928.91 | 6438.802 | 6629.126 | 4722.103 | 8837.49 | 6064.946 | 4759.248 | 4860.867 | 6409.938 |
| 580 | 4630.156 | 7682.784 | 4688.529 | 2282.371 | 11657.998 | 5928.91 | 6436.608 | 6629.126 | 4720.55 | 8837.49 | 6064.946 | 4757.422 | 4858.616 | 6409.938 |
| 581 | 4630.156 | 7680.562 | 4687.281 | 2281.613 | 11657.998 | 5928.91 | 6434.419 | 6629.126 | 4719 | 8837.49 | 6064.946 | 4755.598 | 4856.369 | 6409.938 |
| 582 | 4630.156 | 7678.342 | 4686.035 | 2280.856 | 11657.998 | 5928.91 | 6432.234 | 6629.126 | 4717.453 | 8837.49 | 6064.946 | 4753.775 | 4854.126 | 6409.938 |
| 583 | 4630.156 | 7676.123 | 4684.79 | 2280.1 | 11657.998 | 5928.91 | 6430.053 | 6629.126 | 4715.909 | 8837.49 | 6064.946 | 4752.865 | 4851.887 | 6409.938 |
| 584 | 4630.156 | 7673.906 | 4683.547 | 2279.344 | 11657.998 | 5928.91 | 6427.877 | 6629.126 | 4714.368 | 8837.49 | 6064.946 | 4751.044 | 4849.652 | 6409.938 |
| 585 | 4630.156 | 7671.691 | 4682.305 | 2278.588 | 11657.998 | 5928.91 | 6425.705 | 6629.126 | 4712.83 | 8837.49 | 6064.946 | 4749.225 | 4847.421 | 6409.938 |
| 586 | 4630.156 | 7669.478 | 4681.065 | 2277.833 | 11657.998 | 5928.91 | 6423.537 | 6629.126 | 4711.295 | 8837.49 | 6064.946 | 4748.315 | 4845.194 | 6409.938 |
| 587 | 4630.156 | 7667.266 | 4679.826 | 2277.079 | 11657.998 | 5928.91 | 6421.374 | 6629.126 | 4709.763 | 8837.49 | 6064.946 | 4746.498 | 4842.971 | 6409.938 |
| 588 | 4630.156 | 7665.056 | 4678.589 | 2276.325 | 11657.998 | 5928.91 | 6419.216 | 6629.126 | 4708.235 | 8837.49 | 6064.946 | 4744.682 | 4840.751 | 6409.938 |
| 589 | 4630.156 | 7662.848 | 4677.353 | 2275.571 | 11657.998 | 5928.91 | 6417.061 | 6629.126 | 4706.709 | 8837.49 | 6064.946 | 4743.775 | 4838.536 | 6409.938 |
| 590 | 4630.156 | 7660.642 | 4676.118 | 2275.006 | 11657.998 | 5928.91 | 6414.911 | 6629.126 | 4705.186 | 8837.49 | 6064.946 | 4741.961 | 4836.325 | 6409.938 |
| 591 | 4630.156 | 7658.437 | 4674.885 | 2274.254 | 11657.998 | 5928.91 | 6412.766 | 6629.126 | 4703.667 | 8837.49 | 6064.946 | 4740.149 | 4834.117 | 6409.938 |
| 592 | 4630.156 | 7656.234 | 4673.653 | 2273.501 | 11657.998 | 5928.91 | 6410.624 | 6629.126 | 4702.15 | 8837.49 | 6064.946 | 4739.243 | 4831.914 | 6409.938 |
| 593 | 4630.156 | 7654.033 | 4672.422 | 2272.75 | 11657.998 | 5928.91 | 6408.487 | 6629.126 | 4700.636 | 8837.49 | 6064.946 | 4737.433 | 4829.714 | 6409.938 |
| 594 | 4630.156 | 7651.834 | 4671.193 | 2271.999 | 11657.998 | 5928.91 | 6406.354 | 6629.126 | 4699.126 | 8837.49 | 6064.946 | 4735.624 | 4827.518 | 6409.938 |
| 595 | 4630.156 | 7649.636 | 4669.966 | 2271.248 | 11657.998 | 5928.91 | 6404.225 | 6629.126 | 4697.618 | 8837.49 | 6064.946 | 4733.817 | 4825.326 | 6409.938 |
| 596 | 4630.156 | 7647.44 | 4668.74 | 2270.498 | 11657.998 | 5928.91 | 6402.101 | 6629.126 | 4696.113 | 8837.49 | 6064.946 | 4732.914 | 4823.138 | 6409.938 |
| 597 | 4630.156 | 7645.245 | 4667.515 | 2269.748 | 11657.998 | 5928.91 | 6399.98 | 6629.126 | 4694.611 | 8837.49 | 6064.946 | 4731.108 | 4820.954 | 6409.938 |
| 598 | 4630.156 | 7643.053 | 4666.292 | 2268.999 | 11657.998 | 5928.91 | 6397.864 | 6629.126 | 4693.113 | 8837.49 | 6064.946 | 4729.304 | 4818.773 | 6409.938 |
| 599 | 4630.156 | 7640.862 | 4665.07 | 2268.438 | 11657.998 | 5928.91 | 6395.752 | 6629.126 | 4691.617 | 8837.49 | 6064.946 | 4728.403 | 4816.596 | 6409.938 |
| 600 | 4630.156 | 7638.673 | 4663.849 | 2267.689 | 11657.998 | 5928.91 | 6395.752 | 6629.126 | 4690.124 | 8837.49 | 6064.946 | 4726.601 | 4814.423 | 6409.938 |
| 601 | 4630.156 | 7636.485 | 4662.63 | 2266.941 | 11657.998 | 5928.91 | 6395.752 | 6629.126 | 4688.633 | 8837.49 | 6064.946 | 4724.8 | 4812.254 | 6409.938 |
| 602 | 4630.156 | 7634.299 | 4661.412 | 2266.194 | 11657.998 | 5928.91 | 6395.752 | 6629.126 | 4687.146 | 8837.49 | 6064.946 | 4723.9 | 4810.088 | 6409.938 |
| 603 | 4630.156 | 7632.115 | 4660.196 | 2265.447 | 11657.998 | 5928.91 | 6395.752 | 6629.126 | 4685.662 | 8837.49 | 6064.946 | 4722.102 | 4807.927 | 6409.938 |
| 604 | 4630.156 | 7629.932 | 4658.981 | 2264.701 | 11657.998 | 5928.91 | 6395.752 | 6629.126 | 4684.18 | 8837.49 | 6064.946 | 4720.304 | 4805.768 | 6409.938 |
| 605 | 4630.156 | 7627.752 | 4657.767 | 2263.955 | 11657.998 | 5928.91 | 6395.752 | 6629.126 | 4682.701 | 8837.49 | 6064.946 | 4719.406 | 4803.614 | 6409.938 |
| 606 | 4630.156 | 7625.573 | 4656.555 | 2263.396 | 11657.998 | 5928.91 | 6395.752 | 6629.126 | 4681.226 | 8837.49 | 6064.946 | 4717.611 | 4801.463 | 6409.938 |
| 607 | 4630.156 | 7623.395 | 4655.344 | 2262.651 | 11657.998 | 5928.91 | 6395.752 | 6629.126 | 4679.753 | 8837.49 | 6064.946 | 4715.817 | 4799.316 | 6409.938 |
| 608 | 4630.156 | 7621.219 | 4654.135 | 2261.907 | 11657.998 | 5928.91 | 6395.752 | 6629.126 | 4678.282 | 8837.49 | 6064.946 | 4714.921 | 4797.173 | 6409.938 |
| 609 | 4630.156 | 7619.045 | 4652.927 | 2261.163 | 11657.998 | 5928.91 | 6395.752 | 6629.126 | 4676.815 | 8837.49 | 6064.946 | 4713.129 | 4795.033 | 6409.938 |
| 610 | 4630.156 | 7616.873 | 4651.72 | 2260.419 | 11657.998 | 5928.91 | 6395.752 | 6629.126 | 4675.35 | 8837.49 | 6064.946 | 4712.234 | 4792.897 | 6409.938 |
| 611 | 4630.156 | 7614.702 | 4650.515 | 2259.862 | 11657.998 | 5928.91 | 6395.752 | 6629.126 | 4673.888 | 8837.49 | 6064.946 | 4710.444 | 4790.765 | 6409.938 |
| 612 | 4630.156 | 7612.533 | 4649.311 | 2259.119 | 11657.998 | 5928.91 | 6395.752 | 6629.126 | 4672.429 | 8837.49 | 6064.946 | 4708.656 | 4788.636 | 6409.938 |
| 613 | 4630.156 | 7610.365 | 4648.109 | 2258.377 | 11657.998 | 5928.91 | 6395.752 | 6629.126 | 4670.973 | 8837.49 | 6064.946 | 4707.762 | 4786.511 | 6409.938 |
| 614 | 4630.156 | 7608.2 | 4646.908 | 2257.635 | 11657.998 | 5928.91 | 6395.752 | 6629.126 | 4669.52 | 8837.49 | 6064.946 | 4705.976 | 4784.389 | 6409.938 |
| 615 | 4630.156 | 7606.036 | 4645.708 | 2256.894 | 11657.998 | 5928.91 | 6395.752 | 6629.126 | 4668.069 | 8837.49 | 6064.946 | 4704.191 | 4782.271 | 6409.938 |
| 616 | 4630.156 | 7603.873 | 4644.51 | 2256.339 | 11657.998 | 5928.91 | 6395.752 | 6629.126 | 4666.621 | 8837.49 | 6064.946 | 4703.299 | 4780.157 | 6409.938 |
| 617 | 4630.156 | 7601.712 | 4643.313 | 2255.598 | 11657.998 | 5928.91 | 6395.752 | 6629.126 | 4665.175 | 8837.49 | 6064.946 | 4701.516 | 4778.046 | 6409.938 |
| 618 | 4630.156 | 7599.553 | 4642.117 | 2254.859 | 11657.998 | 5928.91 | 6395.752 | 6629.126 | 4663.733 | 8837.49 | 6064.946 | 4699.735 | 4775.938 | 6409.938 |
| 619 | 4630.156 | 7597.395 | 4640.923 | 2254.119 | 11657.998 | 5928.91 | 6395.752 | 6629.126 | 4662.293 | 8837.49 | 6064.946 | 4698.844 | 4773.835 | 6409.938 |
| 620 | 4630.156 | 7595.239 | 4639.73 | 2253.565 | 11657.998 | 5928.91 | 6395.752 | 6629.126 | 4660.856 | 8837.49 | 6064.946 | 4697.065 | 4771.734 | 6409.938 |
| 621 | 4630.156 | 7593.085 | 4638.539 | 2252.826 | 11657.998 | 5928.91 | 6395.752 | 6629.126 | 4659.421 | 8837.49 | 6064.946 | 4696.176 | 4769.637 | 6409.938 |
| 622 | 4630.156 | 7590.933 | 4637.349 | 2252.088 | 11657.998 | 5928.91 | 6395.752 | 6629.126 | 4657.989 | 8837.49 | 6064.946 | 4694.398 | 4767.544 | 6409.938 |
| 623 | 4630.156 | 7588.781 | 4636.16 | 2251.351 | 11657.998 | 5928.91 | 6395.752 | 6629.126 | 4656.56 | 8837.49 | 6064.946 | 4692.622 | 4765.454 | 6409.938 |
| 624 | 4630.156 | 7586.632 | 4634.973 | 2250.798 | 11657.998 | 5928.91 | 6395.752 | 6629.126 | 4655.134 | 8837.49 | 6064.946 | 4691.734 | 4763.368 | 6409.938 |
| 625 | 4630.156 | 7584.484 | 4633.787 | 2250.061 | 11657.998 | 5928.91 | 6395.752 | 6629.126 | 4653.71 | 8837.49 | 6064.946 | 4689.96 | 4761.285 | 6409.938 |
| 626 | 4630.156 | 7582.338 | 4632.602 | 2249.325 | 11657.998 | 5928.91 | 6395.752 | 6629.126 | 4652.288 | 8837.49 | 6064.946 | 4688.187 | 4759.205 | 6409.938 |
| 627 | 4630.156 | 7580.193 | 4631.419 | 2248.589 | 11657.998 | 5928.91 | 6395.752 | 6629.126 | 4650.87 | 8837.49 | 6064.946 | 4687.302 | 4757.129 | 6409.938 |
| 628 | 4630.156 | 7578.051 | 4630.237 | 2248.038 | 11657.998 | 5928.91 | 6395.752 | 6629.126 | 4649.454 | 8837.49 | 6064.946 | 4685.531 | 4755.056 | 6409.938 |
| 629 | 4630.156 | 7575.909 | 4629.056 | 2247.303 | 11657.998 | 5928.91 | 6395.752 | 6629.126 | 4648.04 | 8837.49 | 6064.946 | 4684.646 | 4752.987 | 6409.938 |
| 630 | 4630.156 | 7573.769 | 4627.877 | 2246.569 | 11657.998 | 5928.91 | 6395.752 | 6629.126 | 4646.63 | 8837.49 | 6064.946 | 4682.877 | 4750.921 | 6409.938 |
| 631 | 4630.156 | 7571.631 | 4626.699 | 2245.835 | 11657.998 | 5928.91 | 6395.752 | 6629.126 | 4645.221 | 8837.49 | 6064.946 | 4681.11 | 4748.859 | 6409.938 |
| 632 | 4630.156 | 7569.495 | 4625.523 | 2245.285 | 11657.998 | 5928.91 | 6395.752 | 6629.126 | 4643.816 | 8837.49 | 6064.946 | 4680.226 | 4746.8 | 6409.938 |
| 633 | 4630.156 | 7567.36 | 4624.348 | 2244.551 | 11657.998 | 5928.91 | 6395.752 | 6629.126 | 4642.413 | 8837.49 | 6064.946 | 4678.461 | 4744.744 | 6409.938 |
| 634 | 4630.156 | 7565.226 | 4623.174 | 2243.819 | 11657.998 | 5928.91 | 6395.752 | 6629.126 | 4641.012 | 8837.49 | 6064.946 | 4677.579 | 4742.692 | 6409.938 |
| 635 | 4630.156 | 7563.095 | 4622.002 | 2243.27 | 11657.998 | 5928.91 | 6395.752 | 6629.126 | 4639.614 | 8837.49 | 6064.946 | 4675.815 | 4740.643 | 6409.938 |
| 636 | 4630.156 | 7560.965 | 4620.83 | 2242.538 | 11657.998 | 5928.91 | 6395.752 | 6629.126 | 4638.219 | 8837.49 | 6064.946 | 4674.053 | 4738.597 | 6409.938 |
| 637 | 4630.156 | 7558.836 | 4619.661 | 2241.807 | 11657.998 | 5928.91 | 6395.752 | 6629.126 | 4636.826 | 8837.49 | 6064.946 | 4673.173 | 4736.554 | 6409.938 |
| 638 | 4630.156 | 7556.709 | 4618.492 | 2241.258 | 11657.998 | 5928.91 | 6395.752 | 6629.126 | 4635.436 | 8837.49 | 6064.946 | 4671.412 | 4734.515 | 6409.938 |
| 639 | 4630.156 | 7554.584 | 4617.325 | 2240.528 | 11657.998 | 5928.91 | 6395.752 | 6629.126 | 4634.048 | 8837.49 | 6064.946 | 4670.533 | 4732.479 | 6409.938 |
| 640 | 4630.156 | 7552.46 | 4616.159 | 2239.798 | 11657.998 | 5928.91 | 6395.752 | 6629.126 | 4632.662 | 8837.49 | 6064.946 | 4668.775 | 4730.447 | 6409.938 |
| 641 | 4630.156 | 7550.337 | 4614.995 | 2239.251 | 11657.998 | 5928.91 | 6395.752 | 6629.126 | 4631.279 | 8837.49 | 6064.946 | 4667.018 | 4728.418 | 6409.938 |
| 642 | 4630.156 | 7548.217 | 4613.832 | 2238.522 | 11657.998 | 5928.91 | 6395.752 | 6629.126 | 4629.899 | 8837.49 | 6064.946 | 4666.14 | 4726.392 | 6409.938 |
| 643 | 4630.156 | 7546.098 | 4612.67 | 2237.793 | 11657.998 | 5928.91 | 6395.752 | 6629.126 | 4628.521 | 8837.49 | 6064.946 | 4664.385 | 4724.369 | 6409.938 |
| 644 | 4630.156 | 7543.98 | 4611.51 | 2237.247 | 11657.998 | 5928.91 | 6395.752 | 6629.126 | 4627.146 | 8837.49 | 6064.946 | 4663.508 | 4722.349 | 6409.938 |
| 645 | 4630.156 | 7541.864 | 4610.351 | 2236.519 | 11657.998 | 5928.91 | 6395.752 | 6629.126 | 4625.773 | 8837.49 | 6064.946 | 4661.755 | 4720.333 | 6409.938 |
| 646 | 4630.156 | 7539.75 | 4609.193 | 2235.792 | 11657.998 | 5928.91 | 6395.752 | 6629.126 | 4624.402 | 8837.49 | 6064.946 | 4660.879 | 4718.32 | 6409.938 |
| 647 | 4630.156 | 7537.637 | 4608.037 | 2235.246 | 11657.998 | 5928.91 | 6395.752 | 6629.126 | 4623.034 | 8837.49 | 6064.946 | 4659.128 | 4716.31 | 6409.938 |
| 648 | 4630.156 | 7535.525 | 4606.882 | 2234.52 | 11657.998 | 5928.91 | 6395.752 | 6629.126 | 4621.669 | 8837.49 | 6064.946 | 4657.379 | 4714.303 | 6409.938 |
| 649 | 4630.156 | 7533.416 | 4605.728 | 2233.794 | 11657.998 | 5928.91 | 6395.752 | 6629.126 | 4620.305 | 8837.49 | 6064.946 | 4656.505 | 4712.3 | 6409.938 |
| 650 | 4630.156 | 7531.307 | 4604.575 | 2233.249 | 11657.998 | 5928.91 | 6395.752 | 6629.126 | 4620.305 | 8837.49 | 6064.946 | 4654.757 | 4710.3 | 6409.938 |
| 651 | 4630.156 | 7529.201 | 4603.424 | 2232.524 | 11657.998 | 5928.91 | 6395.752 | 6629.126 | 4620.305 | 8837.49 | 6064.946 | 4653.884 | 4708.302 | 6409.938 |
| 652 | 4630.156 | 7527.096 | 4602.274 | 2231.981 | 11657.998 | 5928.91 | 6395.752 | 6629.126 | 4620.305 | 8837.49 | 6064.946 | 4652.138 | 4706.308 | 6409.938 |
| 653 | 4630.156 | 7524.992 | 4601.126 | 2231.256 | 11657.998 | 5928.91 | 6395.752 | 6629.126 | 4620.305 | 8837.49 | 6064.946 | 4651.266 | 4704.318 | 6409.938 |
| 654 | 4630.156 | 7522.89 | 4599.979 | 2230.532 | 11657.998 | 5928.91 | 6395.752 | 6629.126 | 4620.305 | 8837.49 | 6064.946 | 4649.522 | 4702.33 | 6409.938 |
| 655 | 4630.156 | 7520.789 | 4598.833 | 2229.989 | 11657.998 | 5928.91 | 6395.752 | 6629.126 | 4620.305 | 8837.49 | 6064.946 | 4647.78 | 4700.345 | 6409.938 |
| 656 | 4630.156 | 7518.69 | 4597.688 | 2229.266 | 11657.998 | 5928.91 | 6395.752 | 6629.126 | 4620.305 | 8837.49 | 6064.946 | 4646.909 | 4698.364 | 6409.938 |
| 657 | 4630.156 | 7516.593 | 4596.545 | 2228.724 | 11657.998 | 5928.91 | 6395.752 | 6629.126 | 4620.305 | 8837.49 | 6064.946 | 4645.169 | 4696.385 | 6409.938 |
| 658 | 4630.156 | 7514.497 | 4595.403 | 2228.002 | 11657.998 | 5928.91 | 6395.752 | 6629.126 | 4620.305 | 8837.49 | 6064.946 | 4644.299 | 4694.41 | 6409.938 |
| 659 | 4630.156 | 7512.403 | 4594.263 | 2227.28 | 11657.998 | 5928.91 | 6395.752 | 6629.126 | 4620.305 | 8837.49 | 6064.946 | 4642.56 | 4692.438 | 6409.938 |
| 660 | 4630.156 | 7510.31 | 4593.123 | 2226.739 | 11657.998 | 5928.91 | 6395.752 | 6629.126 | 4620.305 | 8837.49 | 6064.946 | 4641.692 | 4690.469 | 6409.938 |
| 661 | 4630.156 | 7508.218 | 4591.985 | 2226.018 | 11657.998 | 5928.91 | 6395.752 | 6629.126 | 4620.305 | 8837.49 | 6064.946 | 4639.955 | 4688.503 | 6409.938 |
| 662 | 4630.156 | 7506.128 | 4590.849 | 2225.478 | 11657.998 | 5928.91 | 6395.752 | 6629.126 | 4620.305 | 8837.49 | 6064.946 | 4639.087 | 4686.54 | 6409.938 |
| 663 | 4630.156 | 7504.04 | 4589.713 | 2224.757 | 11657.998 | 5928.91 | 6395.752 | 6629.126 | 4620.305 | 8837.49 | 6064.946 | 4637.353 | 4684.58 | 6409.938 |
| 664 | 4630.156 | 7501.953 | 4588.579 | 2224.038 | 11657.998 | 5928.91 | 6395.752 | 6629.126 | 4620.305 | 8837.49 | 6064.946 | 4635.62 | 4682.623 | 6409.938 |
| 665 | 4630.156 | 7499.868 | 4587.446 | 2223.498 | 11657.998 | 5928.91 | 6395.752 | 6629.126 | 4620.305 | 8837.49 | 6064.946 | 4634.753 | 4680.669 | 6409.938 |
| 666 | 4630.156 | 7497.784 | 4586.315 | 2222.779 | 11657.998 | 5928.91 | 6395.752 | 6629.126 | 4620.305 | 8837.49 | 6064.946 | 4633.022 | 4678.718 | 6409.938 |
| 667 | 4630.156 | 7495.702 | 4585.185 | 2222.24 | 11657.998 | 5928.91 | 6395.752 | 6629.126 | 4620.305 | 8837.49 | 6064.946 | 4632.157 | 4676.77 | 6409.938 |
| 668 | 4630.156 | 7493.621 | 4584.056 | 2221.522 | 11657.998 | 5928.91 | 6395.752 | 6629.126 | 4620.305 | 8837.49 | 6064.946 | 4630.427 | 4674.825 | 6409.938 |
| 669 | 4630.156 | 7491.542 | 4582.928 | 2220.984 | 11657.998 | 5928.91 | 6395.752 | 6629.126 | 4620.305 | 8837.49 | 6064.946 | 4629.563 | 4672.883 | 6409.938 |
| 670 | 4630.156 | 7489.464 | 4581.802 | 2220.266 | 11657.998 | 5928.91 | 6395.752 | 6629.126 | 4620.305 | 8837.49 | 6064.946 | 4627.836 | 4670.944 | 6409.938 |
| 671 | 4630.156 | 7487.388 | 4580.677 | 2219.729 | 11657.998 | 5928.91 | 6395.752 | 6629.126 | 4620.305 | 8837.49 | 6064.946 | 4626.973 | 4669.008 | 6409.938 |
| 672 | 4630.156 | 7485.313 | 4579.553 | 2219.012 | 11657.998 | 5928.91 | 6395.752 | 6629.126 | 4620.305 | 8837.49 | 6064.946 | 4625.247 | 4667.075 | 6409.938 |
| 673 | 4630.156 | 7483.239 | 4578.431 | 2218.475 | 11657.998 | 5928.91 | 6395.752 | 6629.126 | 4620.305 | 8837.49 | 6064.946 | 4624.385 | 4665.145 | 6409.938 |
| 674 | 4630.156 | 7481.168 | 4577.31 | 2217.759 | 11657.998 | 5928.91 | 6395.752 | 6629.126 | 4620.305 | 8837.49 | 6064.946 | 4622.661 | 4663.218 | 6409.938 |
| 675 | 4630.156 | 7479.097 | 4576.19 | 2217.223 | 11657.998 | 5928.91 | 6395.752 | 6629.126 | 4620.305 | 8837.49 | 6064.946 | 4621.8 | 4661.294 | 6409.938 |
| 676 | 4630.156 | 7477.028 | 4575.071 | 2216.508 | 11657.998 | 5928.91 | 6395.752 | 6629.126 | 4620.305 | 8837.49 | 6064.946 | 4620.078 | 4659.373 | 6409.938 |
| 677 | 4630.156 | 7474.961 | 4573.954 | 2215.794 | 11657.998 | 5928.91 | 6395.752 | 6629.126 | 4620.305 | 8837.49 | 6064.946 | 4619.218 | 4657.454 | 6409.938 |
| 678 | 4630.156 | 7472.895 | 4572.838 | 2215.258 | 11657.998 | 5928.91 | 6395.752 | 6629.126 | 4620.305 | 8837.49 | 6064.946 | 4617.498 | 4655.539 | 6409.938 |
| 679 | 4630.156 | 7470.83 | 4571.723 | 2214.545 | 11657.998 | 5928.91 | 6395.752 | 6629.126 | 4620.305 | 8837.49 | 6064.946 | 4615.78 | 4653.626 | 6409.938 |
| 680 | 4630.156 | 7468.767 | 4570.609 | 2214.01 | 11657.998 | 5928.91 | 6395.752 | 6629.126 | 4620.305 | 8837.49 | 6064.946 | 4614.921 | 4651.717 | 6409.938 |
| 681 | 4630.156 | 7466.706 | 4569.497 | 2213.297 | 11657.998 | 5928.91 | 6395.752 | 6629.126 | 4620.305 | 8837.49 | 6064.946 | 4613.204 | 4649.81 | 6409.938 |
| 682 | 4630.156 | 7464.646 | 4568.386 | 2212.763 | 11657.998 | 5928.91 | 6395.752 | 6629.126 | 4620.305 | 8837.49 | 6064.946 | 4612.347 | 4647.906 | 6409.938 |
| 683 | 4630.156 | 7462.587 | 4567.277 | 2212.051 | 11657.998 | 5928.91 | 6395.752 | 6629.126 | 4620.305 | 8837.49 | 6064.946 | 4610.632 | 4646.005 | 6409.938 |
| 684 | 4630.156 | 7460.53 | 4566.168 | 2211.517 | 11657.998 | 5928.91 | 6395.752 | 6629.126 | 4620.305 | 8837.49 | 6064.946 | 4609.775 | 4644.107 | 6409.938 |
| 685 | 4630.156 | 7458.474 | 4565.061 | 2210.983 | 11657.998 | 5928.91 | 6395.752 | 6629.126 | 4620.305 | 8837.49 | 6064.946 | 4608.062 | 4642.211 | 6409.938 |
| 686 | 4630.156 | 7456.42 | 4563.955 | 2210.272 | 11657.998 | 5928.91 | 6395.752 | 6629.126 | 4620.305 | 8837.49 | 6064.946 | 4607.207 | 4640.319 | 6409.938 |
| 687 | 4630.156 | 7454.368 | 4562.851 | 2209.74 | 11657.998 | 5928.91 | 6395.752 | 6629.126 | 4620.305 | 8837.49 | 6064.946 | 4605.496 | 4638.429 | 6409.938 |
| 688 | 4630.156 | 7452.316 | 4561.748 | 2209.03 | 11657.998 | 5928.91 | 6395.752 | 6629.126 | 4620.305 | 8837.49 | 6064.946 | 4604.641 | 4636.542 | 6409.938 |
| 689 | 4630.156 | 7450.266 | 4560.646 | 2208.497 | 11657.998 | 5928.91 | 6395.752 | 6629.126 | 4620.305 | 8837.49 | 6064.946 | 4602.932 | 4634.658 | 6409.938 |
| 690 | 4630.156 | 7448.218 | 4559.545 | 2207.788 | 11657.998 | 5928.91 | 6395.752 | 6629.126 | 4620.305 | 8837.49 | 6064.946 | 4602.078 | 4632.776 | 6409.938 |
| 691 | 4630.156 | 7446.171 | 4558.445 | 2207.256 | 11657.998 | 5928.91 | 6395.752 | 6629.126 | 4620.305 | 8837.49 | 6064.946 | 4600.371 | 4630.898 | 6409.938 |
| 692 | 4630.156 | 7444.125 | 4557.347 | 2206.548 | 11657.998 | 5928.91 | 6395.752 | 6629.126 | 4620.305 | 8837.49 | 6064.946 | 4599.518 | 4629.022 | 6409.938 |
| 693 | 4630.156 | 7442.081 | 4556.25 | 2206.017 | 11657.998 | 5928.91 | 6395.752 | 6629.126 | 4620.305 | 8837.49 | 6064.946 | 4597.813 | 4627.149 | 6409.938 |
| 694 | 4630.156 | 7440.039 | 4555.154 | 2205.309 | 11657.998 | 5928.91 | 6395.752 | 6629.126 | 4620.305 | 8837.49 | 6064.946 | 4596.961 | 4625.279 | 6409.938 |
| 695 | 4630.156 | 7437.997 | 4554.06 | 2204.779 | 11657.998 | 5928.91 | 6395.752 | 6629.126 | 4620.305 | 8837.49 | 6064.946 | 4595.258 | 4623.411 | 6409.938 |
| 696 | 4630.156 | 7435.958 | 4552.967 | 2204.072 | 11657.998 | 5928.91 | 6395.752 | 6629.126 | 4620.305 | 8837.49 | 6064.946 | 4594.406 | 4621.546 | 6409.938 |
| 697 | 4630.156 | 7433.919 | 4551.875 | 2203.542 | 11657.998 | 5928.91 | 6395.752 | 6629.126 | 4620.305 | 8837.49 | 6064.946 | 4592.705 | 4619.684 | 6409.938 |
| 698 | 4630.156 | 7431.882 | 4550.784 | 2203.012 | 11657.998 | 5928.91 | 6395.752 | 6629.126 | 4620.305 | 8837.49 | 6064.946 | 4591.855 | 4617.825 | 6409.938 |
| 699 | 4630.156 | 7429.847 | 4549.694 | 2202.307 | 11657.998 | 5928.91 | 6395.752 | 6629.126 | 4620.305 | 8837.49 | 6064.946 | 4590.155 | 4615.969 | 6409.938 |
| 700 | 4630.156 | 7427.813 | 4548.606 | 2201.778 | 11657.998 | 5928.91 | 6395.752 | 6629.126 | 4620.305 | 8837.49 | 6064.946 | 4589.306 | 4614.115 | 6409.938 |
| 701 | 4630.156 | 7425.78 | 4547.519 | 2201.073 | 11657.998 | 5928.91 | 6395.752 | 6629.126 | 4620.305 | 8837.49 | 6064.946 | 4588.457 | 4612.264 | 6409.938 |
| 702 | 4630.156 | 7423.749 | 4546.433 | 2200.544 | 11657.998 | 5928.91 | 6395.752 | 6629.126 | 4620.305 | 8837.49 | 6064.946 | 4586.76 | 4610.415 | 6409.938 |
| 703 | 4630.156 | 7421.719 | 4545.349 | 2199.84 | 11657.998 | 5928.91 | 6395.752 | 6629.126 | 4620.305 | 8837.49 | 6064.946 | 4585.912 | 4608.569 | 6409.938 |
| 704 | 4630.156 | 7419.691 | 4544.266 | 2199.312 | 11657.998 | 5928.91 | 6395.752 | 6629.126 | 4620.305 | 8837.49 | 6064.946 | 4584.217 | 4606.726 | 6409.938 |
| 705 | 4630.156 | 7417.664 | 4543.184 | 2198.785 | 11657.998 | 5928.91 | 6395.752 | 6629.126 | 4620.305 | 8837.49 | 6064.946 | 4583.37 | 4604.886 | 6409.938 |
| 706 | 4630.156 | 7415.638 | 4542.103 | 2198.082 | 11657.998 | 5928.91 | 6395.752 | 6629.126 | 4620.305 | 8837.49 | 6064.946 | 4581.677 | 4603.048 | 6409.938 |
| 707 | 4630.156 | 7413.614 | 4541.023 | 2197.555 | 11657.998 | 5928.91 | 6395.752 | 6629.126 | 4620.305 | 8837.49 | 6064.946 | 4580.831 | 4601.213 | 6409.938 |
| 708 | 4630.156 | 7411.591 | 4539.945 | 2196.852 | 11657.998 | 5928.91 | 6395.752 | 6629.126 | 4620.305 | 8837.49 | 6064.946 | 4579.14 | 4599.38 | 6409.938 |
| 709 | 4630.156 | 7409.57 | 4538.868 | 2196.326 | 11657.998 | 5928.91 | 6395.752 | 6629.126 | 4620.305 | 8837.49 | 6064.946 | 4578.295 | 4597.551 | 6409.938 |
| 710 | 4630.156 | 7407.55 | 4537.792 | 2195.8 | 11657.998 | 5928.91 | 6395.752 | 6629.126 | 4620.305 | 8837.49 | 6064.946 | 4576.605 | 4595.723 | 6409.938 |
| 711 | 4630.156 | 7405.531 | 4536.718 | 2195.099 | 11657.998 | 5928.91 | 6395.752 | 6629.126 | 4620.305 | 8837.49 | 6064.946 | 4575.761 | 4593.899 | 6409.938 |
| 712 | 4630.156 | 7403.514 | 4535.644 | 2194.573 | 11657.998 | 5928.91 | 6395.752 | 6629.126 | 4620.305 | 8837.49 | 6064.946 | 4574.073 | 4592.077 | 6409.938 |
| 713 | 4630.156 | 7401.498 | 4534.572 | 2193.873 | 11657.998 | 5928.91 | 6395.752 | 6629.126 | 4620.305 | 8837.49 | 6064.946 | 4573.23 | 4590.258 | 6409.938 |
| 714 | 4630.156 | 7399.484 | 4533.501 | 2193.348 | 11657.998 | 5928.91 | 6395.752 | 6629.126 | 4620.305 | 8837.49 | 6064.946 | 4571.544 | 4588.441 | 6409.938 |
| 715 | 4630.156 | 7397.471 | 4532.432 | 2192.823 | 11657.998 | 5928.91 | 6395.752 | 6629.126 | 4620.305 | 8837.49 | 6064.946 | 4570.702 | 4586.627 | 6409.938 |
| 716 | 4630.156 | 7395.459 | 4531.363 | 2192.124 | 11657.998 | 5928.91 | 6395.752 | 6629.126 | 4620.305 | 8837.49 | 6064.946 | 4569.018 | 4584.815 | 6409.938 |
| 717 | 4630.156 | 7393.449 | 4530.296 | 2191.6 | 11657.998 | 5928.91 | 6395.752 | 6629.126 | 4620.305 | 8837.49 | 6064.946 | 4568.177 | 4583.006 | 6409.938 |
| 718 | 4630.156 | 7391.44 | 4529.23 | 2191.076 | 11657.998 | 5928.91 | 6395.752 | 6629.126 | 4620.305 | 8837.49 | 6064.946 | 4567.336 | 4581.2 | 6409.938 |
| 719 | 4630.156 | 7389.433 | 4528.165 | 2190.378 | 11657.998 | 5928.91 | 6395.752 | 6629.126 | 4620.305 | 8837.49 | 6064.946 | 4565.654 | 4579.396 | 6409.938 |
| 720 | 4630.156 | 7387.427 | 4527.102 | 2189.854 | 11657.998 | 5928.91 | 6395.752 | 6629.126 | 4620.305 | 8837.49 | 6064.946 | 4564.814 | 4577.594 | 6409.938 |
| 721 | 4630.156 | 7385.422 | 4526.039 | 2189.331 | 11657.998 | 5928.91 | 6395.752 | 6629.126 | 4620.305 | 8837.49 | 6064.946 | 4563.135 | 4575.796 | 6409.938 |
| 722 | 4630.156 | 7383.418 | 4524.978 | 2188.634 | 11657.998 | 5928.91 | 6395.752 | 6629.126 | 4620.305 | 8837.49 | 6064.946 | 4562.295 | 4573.999 | 6409.938 |
| 723 | 4630.156 | 7381.416 | 4523.918 | 2188.112 | 11657.998 | 5928.91 | 6395.752 | 6629.126 | 4620.305 | 8837.49 | 6064.946 | 4560.618 | 4572.206 | 6409.938 |
| 724 | 4630.156 | 7379.416 | 4522.86 | 2187.589 | 11657.998 | 5928.91 | 6395.752 | 6629.126 | 4620.305 | 8837.49 | 6064.946 | 4559.779 | 4570.414 | 6409.938 |
| 725 | 4630.156 | 7377.417 | 4521.802 | 2186.894 | 11657.998 | 5928.91 | 6395.752 | 6629.126 | 4620.305 | 8837.49 | 6064.946 | 4558.104 | 4568.626 | 6409.938 |
| 726 | 4630.156 | 7375.419 | 4520.746 | 2186.372 | 11657.998 | 5928.91 | 6395.752 | 6629.126 | 4620.305 | 8837.49 | 6064.946 | 4557.266 | 4566.84 | 6409.938 |
| 727 | 4630.156 | 7373.422 | 4519.691 | 2185.851 | 11657.998 | 5928.91 | 6395.752 | 6629.126 | 4620.305 | 8837.49 | 6064.946 | 4556.429 | 4565.056 | 6409.938 |
| 728 | 4630.156 | 7371.427 | 4518.637 | 2185.156 | 11657.998 | 5928.91 | 6395.752 | 6629.126 | 4620.305 | 8837.49 | 6064.946 | 4554.756 | 4563.275 | 6409.938 |
| 729 | 4630.156 | 7369.433 | 4517.584 | 2184.635 | 11657.998 | 5928.91 | 6395.752 | 6629.126 | 4620.305 | 8837.49 | 6064.946 | 4553.92 | 4561.496 | 6409.938 |
| 730 | 4630.156 | 7367.441 | 4516.533 | 2184.114 | 11657.998 | 5928.91 | 6395.752 | 6629.126 | 4620.305 | 8837.49 | 6064.946 | 4552.248 | 4559.72 | 6409.938 |
| 731 | 4630.156 | 7365.45 | 4515.483 | 2183.421 | 11657.998 | 5928.91 | 6395.752 | 6629.126 | 4620.305 | 8837.49 | 6064.946 | 4551.413 | 4557.946 | 6409.938 |
| 732 | 4630.156 | 7363.46 | 4514.434 | 2182.901 | 11657.998 | 5928.91 | 6395.752 | 6629.126 | 4620.305 | 8837.49 | 6064.946 | 4549.743 | 4556.175 | 6409.938 |
| 733 | 4630.156 | 7361.472 | 4513.386 | 2182.381 | 11657.998 | 5928.91 | 6395.752 | 6629.126 | 4620.305 | 8837.49 | 6064.946 | 4548.909 | 4554.406 | 6409.938 |
| 734 | 4630.156 | 7359.485 | 4512.339 | 2181.688 | 11657.998 | 5928.91 | 6395.752 | 6629.126 | 4620.305 | 8837.49 | 6064.946 | 4547.241 | 4552.64 | 6409.938 |
| 735 | 4630.156 | 7357.499 | 4511.294 | 2181.169 | 11657.998 | 5928.91 | 6395.752 | 6629.126 | 4620.305 | 8837.49 | 6064.946 | 4546.408 | 4550.876 | 6409.938 |
| 736 | 4630.156 | 7355.515 | 4510.25 | 2180.65 | 11657.998 | 5928.91 | 6395.752 | 6629.126 | 4620.305 | 8837.49 | 6064.946 | 4545.574 | 4549.115 | 6409.938 |
| 737 | 4630.156 | 7353.532 | 4509.207 | 2179.959 | 11657.998 | 5928.91 | 6395.752 | 6629.126 | 4620.305 | 8837.49 | 6064.946 | 4543.909 | 4547.356 | 6409.938 |
| 738 | 4630.156 | 7351.55 | 4508.165 | 2179.44 | 11657.998 | 5928.91 | 6395.752 | 6629.126 | 4620.305 | 8837.49 | 6064.946 | 4543.077 | 4545.599 | 6409.938 |
| 739 | 4630.156 | 7349.57 | 4507.124 | 2178.922 | 11657.998 | 5928.91 | 6395.752 | 6629.126 | 4620.305 | 8837.49 | 6064.946 | 4541.413 | 4543.845 | 6409.938 |
| 740 | 4630.156 | 7347.591 | 4506.085 | 2178.404 | 11657.998 | 5928.91 | 6395.752 | 6629.126 | 4620.305 | 8837.49 | 6064.946 | 4540.582 | 4542.093 | 6409.938 |
| 741 | 4630.156 | 7345.613 | 4505.047 | 2177.714 | 11657.998 | 5928.91 | 6395.752 | 6629.126 | 4620.305 | 8837.49 | 6064.946 | 4539.751 | 4540.344 | 6409.938 |
| 742 | 4630.156 | 7343.637 | 4504.01 | 2177.197 | 11657.998 | 5928.91 | 6395.752 | 6629.126 | 4620.305 | 8837.49 | 6064.946 | 4538.09 | 4538.597 | 6409.938 |
| 743 | 4630.156 | 7341.662 | 4502.974 | 2176.68 | 11657.998 | 5928.91 | 6395.752 | 6629.126 | 4620.305 | 8837.49 | 6064.946 | 4537.26 | 4536.852 | 6409.938 |
| 744 | 4630.156 | 7339.688 | 4501.939 | 2175.991 | 11657.998 | 5928.91 | 6395.752 | 6629.126 | 4620.305 | 8837.49 | 6064.946 | 4535.601 | 4535.11 | 6409.938 |
| 745 | 4630.156 | 7337.716 | 4500.906 | 2175.475 | 11657.998 | 5928.91 | 6395.752 | 6629.126 | 4620.305 | 8837.49 | 6064.946 | 4534.771 | 4533.37 | 6409.938 |
| 746 | 4630.156 | 7335.745 | 4499.873 | 2174.958 | 11657.998 | 5928.91 | 6395.752 | 6629.126 | 4620.305 | 8837.49 | 6064.946 | 4533.114 | 4531.633 | 6409.938 |
| 747 | 4630.156 | 7333.775 | 4498.842 | 2174.443 | 11657.998 | 5928.91 | 6395.752 | 6629.126 | 4620.305 | 8837.49 | 6064.946 | 4532.286 | 4529.897 | 6409.938 |
| 748 | 4630.156 | 7331.807 | 4497.812 | 2173.755 | 11657.998 | 5928.91 | 6395.752 | 6629.126 | 4620.305 | 8837.49 | 6064.946 | 4531.458 | 4528.165 | 6409.938 |
| 749 | 4630.156 | 7329.84 | 4496.784 | 2173.24 | 11657.998 | 5928.91 | 6395.752 | 6629.126 | 4620.305 | 8837.49 | 6064.946 | 4529.803 | 4526.434 | 6409.938 |
| 750 | 4630.156 | 7327.874 | 4495.756 | 2172.724 | 11657.998 | 5928.91 | 6395.752 | 6629.126 | 4620.305 | 8837.49 | 6064.946 | 4528.976 | 4524.706 | 6409.938 |
| 751 | 4630.156 | 7325.91 | 4494.73 | 2172.209 | 11657.998 | 5928.91 | 6395.752 | 6629.126 | 4620.305 | 8837.49 | 6064.946 | 4527.323 | 4522.981 | 6409.938 |
| 752 | 4630.156 | 7323.947 | 4493.705 | 2171.523 | 11657.998 | 5928.91 | 6395.752 | 6629.126 | 4620.305 | 8837.49 | 6064.946 | 4526.496 | 4521.257 | 6409.938 |
| 753 | 4630.156 | 7321.985 | 4492.681 | 2171.009 | 11657.998 | 5928.91 | 6395.752 | 6629.126 | 4620.305 | 8837.49 | 6064.946 | 4525.67 | 4519.536 | 6409.938 |
| 754 | 4630.156 | 7320.025 | 4491.658 | 2170.495 | 11657.998 | 5928.91 | 6395.752 | 6629.126 | 4620.305 | 8837.49 | 6064.946 | 4524.02 | 4517.817 | 6409.938 |
| 755 | 4630.156 | 7318.065 | 4490.636 | 2169.981 | 11657.998 | 5928.91 | 6395.752 | 6629.126 | 4620.305 | 8837.49 | 6064.946 | 4523.195 | 4516.101 | 6409.938 |
| 756 | 4630.156 | 7316.108 | 4489.615 | 2169.296 | 11657.998 | 5928.91 | 6395.752 | 6629.126 | 4620.305 | 8837.49 | 6064.946 | 4521.546 | 4514.387 | 6409.938 |
| 757 | 4630.156 | 7314.151 | 4488.596 | 2168.783 | 11657.998 | 5928.91 | 6395.752 | 6629.126 | 4620.305 | 8837.49 | 6064.946 | 4520.722 | 4512.675 | 6409.938 |
| 758 | 4630.156 | 7312.196 | 4487.578 | 2168.27 | 11657.998 | 5928.91 | 6395.752 | 6629.126 | 4620.305 | 8837.49 | 6064.946 | 4519.898 | 4510.965 | 6409.938 |
| 759 | 4630.156 | 7310.242 | 4486.561 | 2167.757 | 11657.998 | 5928.91 | 6395.752 | 6629.126 | 4620.305 | 8837.49 | 6064.946 | 4518.251 | 4509.258 | 6409.938 |
| 760 | 4630.156 | 7308.289 | 4485.545 | 2167.074 | 11657.998 | 5928.91 | 6395.752 | 6629.126 | 4620.305 | 8837.49 | 6064.946 | 4517.429 | 4507.553 | 6409.938 |
| 761 | 4630.156 | 7306.338 | 4484.531 | 2166.562 | 11657.998 | 5928.91 | 6395.752 | 6629.126 | 4620.305 | 8837.49 | 6064.946 | 4515.784 | 4505.85 | 6409.938 |
| 762 | 4630.156 | 7304.388 | 4483.517 | 2166.05 | 11657.998 | 5928.91 | 6395.752 | 6629.126 | 4620.305 | 8837.49 | 6064.946 | 4514.962 | 4504.15 | 6409.938 |
| 763 | 4630.156 | 7302.439 | 4482.505 | 2165.538 | 11657.998 | 5928.91 | 6395.752 | 6629.126 | 4620.305 | 8837.49 | 6064.946 | 4514.14 | 4502.452 | 6409.938 |
| 764 | 4630.156 | 7300.492 | 4481.494 | 2165.026 | 11657.998 | 5928.91 | 6395.752 | 6629.126 | 4620.305 | 8837.49 | 6064.946 | 4512.498 | 4500.756 | 6409.938 |
| 765 | 4630.156 | 7298.545 | 4480.484 | 2164.345 | 11657.998 | 5928.91 | 6395.752 | 6629.126 | 4620.305 | 8837.49 | 6064.946 | 4511.677 | 4499.062 | 6409.938 |
| 766 | 4630.156 | 7296.601 | 4479.475 | 2163.834 | 11657.998 | 5928.91 | 6395.752 | 6629.126 | 4620.305 | 8837.49 | 6064.946 | 4510.036 | 4497.371 | 6409.938 |
| 767 | 4630.156 | 7294.657 | 4478.467 | 2163.323 | 11657.998 | 5928.91 | 6395.752 | 6629.126 | 4620.305 | 8837.49 | 6064.946 | 4509.217 | 4495.682 | 6409.938 |
| 768 | 4630.156 | 7292.715 | 4477.461 | 2162.813 | 11657.998 | 5928.91 | 6395.752 | 6629.126 | 4620.305 | 8837.49 | 6064.946 | 4508.397 | 4493.995 | 6409.938 |
| 769 | 4630.156 | 7290.773 | 4476.455 | 2162.302 | 11657.998 | 5928.91 | 6395.752 | 6629.126 | 4620.305 | 8837.49 | 6064.946 | 4506.759 | 4492.31 | 6409.938 |
| 770 | 4630.156 | 7288.834 | 4475.451 | 2161.623 | 11657.998 | 5928.91 | 6395.752 | 6629.126 | 4620.305 | 8837.49 | 6064.946 | 4505.94 | 4490.627 | 6409.938 |
| 771 | 4630.156 | 7286.895 | 4474.448 | 2161.113 | 11657.998 | 5928.91 | 6395.752 | 6629.126 | 4620.305 | 8837.49 | 6064.946 | 4505.122 | 4488.947 | 6409.938 |
| 772 | 4630.156 | 7284.958 | 4473.446 | 2160.603 | 11657.998 | 5928.91 | 6395.752 | 6629.126 | 4620.305 | 8837.49 | 6064.946 | 4503.486 | 4487.269 | 6409.938 |
| 773 | 4630.156 | 7283.022 | 4472.445 | 2160.094 | 11657.998 | 5928.91 | 6395.752 | 6629.126 | 4620.305 | 8837.49 | 6064.946 | 4502.668 | 4485.593 | 6409.938 |
| 774 | 4630.156 | 7281.087 | 4471.446 | 2159.585 | 11657.998 | 5928.91 | 6395.752 | 6629.126 | 4620.305 | 8837.49 | 6064.946 | 4501.034 | 4483.919 | 6409.938 |
| 775 | 4630.156 | 7279.154 | 4470.447 | 2159.077 | 11657.998 | 5928.91 | 6395.752 | 6629.126 | 4620.305 | 8837.49 | 6064.946 | 4500.218 | 4482.248 | 6409.938 |
| 776 | 4630.156 | 7277.222 | 4469.45 | 2158.399 | 11657.998 | 5928.91 | 6395.752 | 6629.126 | 4620.305 | 8837.49 | 6064.946 | 4499.401 | 4480.578 | 6409.938 |
| 777 | 4630.156 | 7275.291 | 4468.454 | 2157.891 | 11657.998 | 5928.91 | 6395.752 | 6629.126 | 4620.305 | 8837.49 | 6064.946 | 4497.77 | 4478.911 | 6409.938 |
| 778 | 4630.156 | 7273.361 | 4467.459 | 2157.383 | 11657.998 | 5928.91 | 6395.752 | 6629.126 | 4620.305 | 8837.49 | 6064.946 | 4496.954 | 4477.246 | 6409.938 |
| 779 | 4630.156 | 7271.433 | 4466.465 | 2156.875 | 11657.998 | 5928.91 | 6395.752 | 6629.126 | 4620.305 | 8837.49 | 6064.946 | 4496.139 | 4475.583 | 6409.938 |
| 780 | 4630.156 | 7269.506 | 4465.472 | 2156.368 | 11657.998 | 5928.91 | 6395.752 | 6629.126 | 4620.305 | 8837.49 | 6064.946 | 4494.51 | 4473.923 | 6409.938 |
| 781 | 4630.156 | 7267.58 | 4464.481 | 2155.86 | 11657.998 | 5928.91 | 6395.752 | 6629.126 | 4620.305 | 8837.49 | 6064.946 | 4493.696 | 4472.264 | 6409.938 |
| 782 | 4630.156 | 7265.655 | 4463.49 | 2155.185 | 11657.998 | 5928.91 | 6395.752 | 6629.126 | 4620.305 | 8837.49 | 6064.946 | 4492.068 | 4470.608 | 6409.938 |
| 783 | 4630.156 | 7263.732 | 4462.501 | 2154.678 | 11657.998 | 5928.91 | 6395.752 | 6629.126 | 4620.305 | 8837.49 | 6064.946 | 4491.255 | 4468.953 | 6409.938 |
| 784 | 4630.156 | 7261.81 | 4461.513 | 2154.172 | 11657.998 | 5928.91 | 6395.752 | 6629.126 | 4620.305 | 8837.49 | 6064.946 | 4490.442 | 4467.301 | 6409.938 |
| 785 | 4630.156 | 7259.889 | 4460.526 | 2153.665 | 11657.998 | 5928.91 | 6395.752 | 6629.126 | 4620.305 | 8837.49 | 6064.946 | 4488.817 | 4465.651 | 6409.938 |
| 786 | 4630.156 | 7257.97 | 4459.54 | 2153.16 | 11657.998 | 5928.91 | 6395.752 | 6629.126 | 4620.305 | 8837.49 | 6064.946 | 4488.004 | 4464.003 | 6409.938 |
| 787 | 4630.156 | 7256.051 | 4458.555 | 2152.654 | 11657.998 | 5928.91 | 6395.752 | 6629.126 | 4620.305 | 8837.49 | 6064.946 | 4487.192 | 4462.358 | 6409.938 |
| 788 | 4630.156 | 7254.134 | 4457.571 | 2151.98 | 11657.998 | 5928.91 | 6395.752 | 6629.126 | 4620.305 | 8837.49 | 6064.946 | 4485.57 | 4460.714 | 6409.938 |
| 789 | 4630.156 | 7252.218 | 4456.589 | 2151.475 | 11657.998 | 5928.91 | 6395.752 | 6629.126 | 4620.305 | 8837.49 | 6064.946 | 4484.759 | 4459.073 | 6409.938 |
| 790 | 4630.156 | 7250.304 | 4455.607 | 2150.97 | 11657.998 | 5928.91 | 6395.752 | 6629.126 | 4620.305 | 8837.49 | 6064.946 | 4483.948 | 4457.433 | 6409.938 |
| 791 | 4630.156 | 7248.39 | 4454.627 | 2150.465 | 11657.998 | 5928.91 | 6395.752 | 6629.126 | 4620.305 | 8837.49 | 6064.946 | 4482.327 | 4455.796 | 6409.938 |
| 792 | 4630.156 | 7246.478 | 4453.648 | 2149.961 | 11657.998 | 5928.91 | 6395.752 | 6629.126 | 4620.305 | 8837.49 | 6064.946 | 4481.518 | 4454.16 | 6409.938 |
| 793 | 4630.156 | 7244.567 | 4452.67 | 2149.457 | 11657.998 | 5928.91 | 6395.752 | 6629.126 | 4620.305 | 8837.49 | 6064.946 | 4480.708 | 4452.527 | 6409.938 |
| 794 | 4630.156 | 7242.658 | 4451.693 | 2148.953 | 11657.998 | 5928.91 | 6395.752 | 6629.126 | 4620.305 | 8837.49 | 6064.946 | 4479.09 | 4450.896 | 6409.938 |
| 795 | 4630.156 | 7240.749 | 4450.718 | 2148.449 | 11657.998 | 5928.91 | 6395.752 | 6629.126 | 4620.305 | 8837.49 | 6064.946 | 4478.281 | 4449.267 | 6409.938 |
| 796 | 4630.156 | 7238.842 | 4449.743 | 2147.946 | 11657.998 | 5928.91 | 6395.752 | 6629.126 | 4620.305 | 8837.49 | 6064.946 | 4476.665 | 4447.64 | 6409.938 |
| 797 | 4630.156 | 7236.936 | 4448.769 | 2147.275 | 11657.998 | 5928.91 | 6395.752 | 6629.126 | 4620.305 | 8837.49 | 6064.946 | 4475.857 | 4446.015 | 6409.938 |
| 798 | 4630.156 | 7235.032 | 4447.797 | 2146.772 | 11657.998 | 5928.91 | 6395.752 | 6629.126 | 4620.305 | 8837.49 | 6064.946 | 4475.05 | 4444.393 | 6409.938 |
| 799 | 4630.156 | 7233.128 | 4446.826 | 2146.269 | 11657.998 | 5928.91 | 6395.752 | 6629.126 | 4620.305 | 8837.49 | 6064.946 | 4473.436 | 4442.772 | 6409.938 |